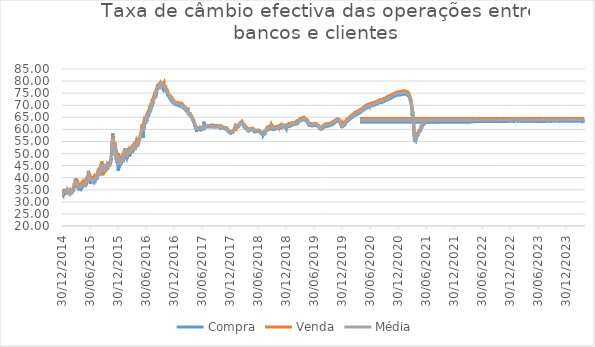
| Category | Compra | Venda | Média |
|---|---|---|---|
| 30/12/2014 | 33.3 | 35.03 | 34.17 |
| 31/12/2014 | 33.58 | 34.35 | 33.97 |
| 05/01/2015 | 32.82 | 34.21 | 33.52 |
| 06/01/2015 | 33.54 | 34.04 | 33.79 |
| 07/01/2015 | 33.3 | 34.14 | 33.72 |
| 08/01/2015 | 33.04 | 34.46 | 33.75 |
| 09/01/2015 | 33.3 | 34.08 | 33.69 |
| 12/01/2015 | 33.65 | 34.8 | 34.23 |
| 13/01/2015 | 32.78 | 35.18 | 33.98 |
| 14/01/2015 | 33.29 | 34.6 | 33.95 |
| 16/01/2015 | 34.04 | 34.74 | 34.39 |
| 19/01/2015 | 34.08 | 34.64 | 34.36 |
| 20/01/2015 | 34.07 | 34.61 | 34.34 |
| 21/01/2015 | 34.06 | 34.84 | 34.45 |
| 22/01/2015 | 34.35 | 34.53 | 34.44 |
| 23/01/2015 | 34.23 | 34.86 | 34.55 |
| 26/01/2015 | 34.39 | 34.87 | 34.63 |
| 27/01/2015 | 34.22 | 35.08 | 34.65 |
| 28/01/2015 | 34.43 | 35.09 | 34.76 |
| 29/01/2015 | 34.36 | 35.43 | 34.9 |
| 30/01/2015 | 33.89 | 33.13 | 33.51 |
| 02/02/2015 | 34.33 | 35.3 | 34.82 |
| 04/02/2015 | 34.2 | 33.6 | 33.9 |
| 05/02/2015 | 34.37 | 35.4 | 34.89 |
| 06/02/2015 | 33.99 | 35.44 | 34.72 |
| 09/02/2015 | 34.26 | 34.74 | 34.5 |
| 10/02/2015 | 33.88 | 34.82 | 34.35 |
| 11/02/2015 | 34.07 | 35.46 | 34.77 |
| 12/02/2015 | 34.16 | 35.29 | 34.73 |
| 13/02/2015 | 34.11 | 34.95 | 34.53 |
| 16/02/2015 | 34.38 | 35.14 | 34.76 |
| 17/02/2015 | 34.41 | 35.14 | 34.78 |
| 18/02/2015 | 34.04 | 34.99 | 34.52 |
| 19/02/2015 | 34.4 | 35.06 | 34.73 |
| 20/02/2015 | 33.67 | 34.35 | 34.01 |
| 23/02/2015 | 34.15 | 34.88 | 34.52 |
| 24/02/2015 | 33.84 | 34.75 | 34.3 |
| 25/02/2015 | 33.94 | 34.78 | 34.36 |
| 26/02/2015 | 34.37 | 34.65 | 34.51 |
| 27/02/2015 | 33.7 | 34.78 | 34.24 |
| 02/03/2015 | 33.42 | 34.19 | 33.81 |
| 03/03/2015 | 33.7 | 33.62 | 33.66 |
| 04/03/2015 | 33.59 | 34.63 | 34.11 |
| 05/03/2015 | 33.92 | 34.58 | 34.25 |
| 06/03/2015 | 33.8 | 34.66 | 34.23 |
| 09/03/2015 | 33.49 | 34.4 | 33.95 |
| 10/03/2015 | 34.04 | 34.76 | 34.4 |
| 11/03/2015 | 34.13 | 34.71 | 34.42 |
| 12/03/2015 | 34.12 | 35.02 | 34.57 |
| 13/03/2015 | 34.54 | 35.8 | 35.17 |
| 16/03/2015 | 34.73 | 36 | 35.37 |
| 17/03/2015 | 35.19 | 36.22 | 35.71 |
| 18/03/2015 | 35.24 | 36.25 | 35.75 |
| 19/03/2015 | 36.42 | 37.78 | 37.1 |
| 20/03/2015 | 36.27 | 37.54 | 36.91 |
| 23/03/2015 | 36.97 | 36.89 | 36.93 |
| 24/03/2015 | 37.26 | 37.73 | 37.5 |
| 25/03/2015 | 37.06 | 38.73 | 37.9 |
| 26/03/2015 | 37.43 | 39.45 | 38.44 |
| 27/03/2015 | 38.55 | 38.84 | 38.7 |
| 30/03/2015 | 38.3 | 39.3 | 38.8 |
| 31/03/2015 | 37.46 | 39.74 | 38.6 |
| 01/04/2015 | 37.33 | 39.43 | 38.38 |
| 02/04/2015 | 36.8 | 39.34 | 38.07 |
| 03/04/2015 | 37.9 | 38.23 | 38.07 |
| 06/04/2015 | 35.96 | 39.09 | 37.53 |
| 08/04/2015 | 36.61 | 36.72 | 36.67 |
| 09/04/2015 | 36.22 | 37.85 | 37.04 |
| 10/04/2015 | 36.3 | 36.45 | 36.38 |
| 13/04/2015 | 35.83 | 37.33 | 36.58 |
| 14/04/2015 | 35.69 | 36.86 | 36.28 |
| 15/04/2015 | 35.51 | 37.01 | 36.26 |
| 16/04/2015 | 35.53 | 36.89 | 36.21 |
| 17/04/2015 | 36.54 | 36.5 | 36.52 |
| 20/04/2015 | 35.65 | 36.7 | 36.18 |
| 21/04/2015 | 35.44 | 36.63 | 36.04 |
| 22/04/2015 | 35.7 | 36.72 | 36.21 |
| 23/04/2015 | 35.34 | 37.46 | 36.4 |
| 24/04/2015 | 35.81 | 36.83 | 36.32 |
| 27/04/2015 | 35.2 | 36.86 | 36.03 |
| 28/04/2015 | 35.41 | 37.01 | 36.21 |
| 29/04/2015 | 35.35 | 36.93 | 36.14 |
| 30/04/2015 | 35.54 | 36.79 | 36.17 |
| 04/05/2015 | 35.52 | 37.62 | 36.57 |
| 05/05/2015 | 35.53 | 37.5 | 36.52 |
| 06/05/2015 | 35.77 | 37.04 | 36.41 |
| 07/05/2015 | 36.22 | 36.87 | 36.55 |
| 08/05/2015 | 35.74 | 36.93 | 36.34 |
| 11/05/2015 | 36.08 | 37.77 | 36.93 |
| 12/05/2015 | 36.17 | 37.32 | 36.75 |
| 13/05/2015 | 36.12 | 37.45 | 36.79 |
| 14/05/2015 | 36.46 | 37.63 | 37.05 |
| 15/05/2015 | 36.73 | 37.22 | 36.98 |
| 18/05/2015 | 36.92 | 37.7 | 37.31 |
| 19/05/2015 | 36.82 | 37.53 | 37.18 |
| 20/05/2015 | 36.88 | 37.89 | 37.39 |
| 21/05/2015 | 36.71 | 38.2 | 37.46 |
| 22/05/2015 | 36.87 | 38.1 | 37.49 |
| 25/05/2015 | 36.82 | 37.81 | 37.32 |
| 26/05/2015 | 36.73 | 38.05 | 37.39 |
| 27/05/2015 | 36.67 | 37.94 | 37.31 |
| 28/05/2015 | 36.9 | 37.56 | 37.23 |
| 29/05/2015 | 36.82 | 38.17 | 37.5 |
| 01/06/2015 | 36.65 | 38.06 | 37.36 |
| 02/06/2015 | 37.05 | 38.23 | 37.64 |
| 03/06/2015 | 37.2 | 38.09 | 37.65 |
| 04/06/2015 | 36.96 | 38.31 | 37.64 |
| 05/06/2015 | 37.31 | 39.33 | 38.32 |
| 08/06/2015 | 37.72 | 38.7 | 38.21 |
| 09/06/2015 | 38.53 | 39 | 38.77 |
| 10/06/2015 | 37.8 | 39.25 | 38.53 |
| 11/06/2015 | 38.03 | 39.46 | 38.75 |
| 12/06/2015 | 37.93 | 38.8 | 38.37 |
| 15/06/2015 | 38 | 38.98 | 38.49 |
| 16/06/2015 | 37.95 | 39.3 | 38.63 |
| 17/06/2015 | 38.69 | 40.02 | 39.36 |
| 18/06/2015 | 39.88 | 41.19 | 40.54 |
| 19/06/2015 | 39.63 | 42.85 | 41.24 |
| 22/06/2015 | 39.38 | 41.44 | 40.41 |
| 23/06/2015 | 39.65 | 42.02 | 40.84 |
| 24/06/2015 | 39.44 | 41.97 | 40.71 |
| 26/06/2015 | 38.99 | 42.25 | 40.62 |
| 29/06/2015 | 38.89 | 41 | 39.95 |
| 30/06/2015 | 38.81 | 40.86 | 39.84 |
| 01/07/2015 | 38.63 | 40.79 | 39.71 |
| 02/07/2015 | 38.45 | 40.5 | 39.48 |
| 03/07/2015 | 38 | 40.61 | 39.31 |
| 06/07/2015 | 38.35 | 39.98 | 39.17 |
| 07/07/2015 | 38.06 | 40.24 | 39.15 |
| 08/07/2015 | 38.34 | 39.81 | 39.08 |
| 09/07/2015 | 38.24 | 39.75 | 39 |
| 10/07/2015 | 38.11 | 39.95 | 39.03 |
| 13/07/2015 | 37.93 | 39.81 | 38.87 |
| 14/07/2015 | 37.7 | 39.37 | 38.54 |
| 15/07/2015 | 38.04 | 39.78 | 38.91 |
| 16/07/2015 | 38.69 | 40.53 | 39.61 |
| 17/07/2015 | 38.2 | 40.38 | 39.29 |
| 20/07/2015 | 38.01 | 39.71 | 38.86 |
| 21/07/2015 | 38 | 40.18 | 39.09 |
| 22/07/2015 | 38.19 | 39.08 | 38.64 |
| 23/07/2015 | 38.25 | 39.78 | 39.02 |
| 24/07/2015 | 38.28 | 39.77 | 39.03 |
| 27/07/2015 | 38.65 | 40.35 | 39.5 |
| 28/07/2015 | 38.21 | 40.45 | 39.33 |
| 29/07/2015 | 39.05 | 40.6 | 39.83 |
| 30/07/2015 | 38.74 | 40.77 | 39.76 |
| 31/07/2015 | 38.48 | 41.08 | 39.78 |
| 03/08/2015 | 38.76 | 40.86 | 39.81 |
| 04/08/2015 | 38.25 | 40.78 | 39.52 |
| 05/08/2015 | 39.04 | 40.5 | 39.77 |
| 06/08/2015 | 39.24 | 39.93 | 39.59 |
| 07/08/2015 | 38.72 | 39.48 | 39.1 |
| 10/08/2015 | 38.7 | 40.88 | 39.79 |
| 11/08/2015 | 39.2 | 41.2 | 40.2 |
| 12/08/2015 | 40.19 | 40.75 | 40.47 |
| 13/08/2015 | 39.1 | 41.3 | 40.2 |
| 14/08/2015 | 39.63 | 41.46 | 40.55 |
| 17/08/2015 | 40.86 | 41.74 | 41.3 |
| 18/08/2015 | 40.36 | 42.09 | 41.23 |
| 19/08/2015 | 40.19 | 41.71 | 40.95 |
| 20/08/2015 | 40.64 | 42.68 | 41.66 |
| 21/08/2015 | 40.65 | 42.64 | 41.65 |
| 24/08/2015 | 41.47 | 42.75 | 42.11 |
| 25/08/2015 | 41.48 | 42.23 | 41.86 |
| 26/08/2015 | 40.88 | 43.22 | 42.05 |
| 27/08/2015 | 41.72 | 42.61 | 42.17 |
| 28/08/2015 | 41.93 | 42.46 | 42.2 |
| 31/08/2015 | 41.44 | 40.99 | 41.22 |
| 01/09/2015 | 41.72 | 43.45 | 42.59 |
| 02/09/2015 | 42.74 | 44.39 | 43.57 |
| 03/09/2015 | 43.26 | 43.49 | 43.38 |
| 04/09/2015 | 43.4 | 43.47 | 43.44 |
| 08/09/2015 | 43.22 | 45.14 | 44.18 |
| 09/09/2015 | 44.42 | 45.18 | 44.8 |
| 10/09/2015 | 43.25 | 45.61 | 44.43 |
| 11/09/2015 | 43.45 | 42.69 | 43.07 |
| 14/09/2015 | 44.71 | 46.11 | 45.41 |
| 15/09/2015 | 43.95 | 45.25 | 44.6 |
| 16/09/2015 | 44.14 | 46.66 | 45.4 |
| 17/09/2015 | 44 | 44.38 | 44.19 |
| 18/09/2015 | 43.06 | 44.51 | 43.79 |
| 21/09/2015 | 43.74 | 45.54 | 44.64 |
| 22/09/2015 | 43.85 | 41.02 | 42.44 |
| 23/09/2015 | 43.73 | 44.76 | 44.25 |
| 24/09/2015 | 43.85 | 44.26 | 44.06 |
| 28/09/2015 | 43.86 | 41.87 | 42.87 |
| 29/09/2015 | 43.9 | 44.76 | 44.33 |
| 30/09/2015 | 44.07 | 44.95 | 44.51 |
| 01/10/2015 | 43.89 | 44.58 | 44.24 |
| 02/10/2015 | 43.74 | 45.23 | 44.49 |
| 06/10/2015 | 44.32 | 45.27 | 44.8 |
| 07/10/2015 | 44.47 | 42.27 | 43.37 |
| 08/10/2015 | 44.22 | 44.51 | 44.37 |
| 09/10/2015 | 44.31 | 45.55 | 44.93 |
| 12/10/2015 | 44.33 | 43.66 | 44 |
| 13/10/2015 | 43.2 | 44.74 | 43.97 |
| 14/10/2015 | 43.98 | 43.11 | 43.55 |
| 15/10/2015 | 44.13 | 45.26 | 44.7 |
| 16/10/2015 | 44.32 | 43.63 | 43.98 |
| 19/10/2015 | 44.25 | 43.16 | 43.71 |
| 20/10/2015 | 44.32 | 45.4 | 44.86 |
| 21/10/2015 | 44.31 | 44.73 | 44.52 |
| 22/10/2015 | 45.04 | 46.14 | 45.59 |
| 23/10/2015 | 44.88 | 45.56 | 45.22 |
| 26/10/2015 | 44.57 | 44.19 | 44.38 |
| 27/10/2015 | 44.34 | 45.78 | 45.06 |
| 28/10/2015 | 44.52 | 45.05 | 44.79 |
| 29/10/2015 | 45.14 | 44.83 | 44.99 |
| 30/10/2015 | 44.86 | 46.31 | 45.59 |
| 02/11/2015 | 44.46 | 44.5 | 44.48 |
| 03/11/2015 | 44.51 | 45.75 | 45.13 |
| 04/11/2015 | 45.43 | 45.83 | 45.63 |
| 05/11/2015 | 45.69 | 45.99 | 45.84 |
| 06/11/2015 | 45.47 | 45.27 | 45.37 |
| 09/11/2015 | 45.82 | 46.8 | 46.31 |
| 11/11/2015 | 45.91 | 45.95 | 45.93 |
| 12/11/2015 | 46.72 | 46.94 | 46.83 |
| 13/11/2015 | 47.09 | 46.86 | 46.98 |
| 16/11/2015 | 47.54 | 47.31 | 47.43 |
| 17/11/2015 | 49.13 | 50.32 | 49.73 |
| 18/11/2015 | 50.29 | 51.49 | 50.89 |
| 19/11/2015 | 52.07 | 52.21 | 52.14 |
| 20/11/2015 | 53.65 | 53.95 | 53.8 |
| 23/11/2015 | 55.36 | 53.74 | 54.55 |
| 24/11/2015 | 55.82 | 57.62 | 56.72 |
| 25/11/2015 | 58.34 | 55.73 | 57.04 |
| 26/11/2015 | 56.42 | 55.4 | 55.91 |
| 27/11/2015 | 55.97 | 56.02 | 56 |
| 30/11/2015 | 55.68 | 57.12 | 56.4 |
| 01/12/2015 | 53.92 | 53.72 | 53.82 |
| 02/12/2015 | 54.07 | 55.15 | 54.61 |
| 03/12/2015 | 53.48 | 54.8 | 54.14 |
| 04/12/2015 | 52.91 | 54.54 | 53.73 |
| 07/12/2015 | 53.23 | 54.92 | 54.08 |
| 08/12/2015 | 51.72 | 53.03 | 52.38 |
| 09/12/2015 | 50.76 | 54.64 | 52.7 |
| 10/12/2015 | 50.76 | 51.49 | 51.13 |
| 11/12/2015 | 50.67 | 49.01 | 49.84 |
| 14/12/2015 | 48.63 | 52.42 | 50.53 |
| 15/12/2015 | 48.53 | 51.27 | 49.9 |
| 16/12/2015 | 47.74 | 49.86 | 48.8 |
| 17/12/2015 | 47.86 | 51.25 | 49.56 |
| 18/12/2015 | 47.48 | 49.32 | 48.4 |
| 21/12/2015 | 47.1 | 49.86 | 48.48 |
| 22/12/2015 | 46.42 | 50.41 | 48.42 |
| 23/12/2015 | 46.11 | 49.33 | 47.72 |
| 24/12/2015 | 46.74 | 48.37 | 47.56 |
| 28/12/2015 | 45.72 | 48.97 | 47.35 |
| 29/12/2015 | 45.89 | 48.02 | 46.96 |
| 30/12/2015 | 45.76 | 48.83 | 47.3 |
| 31/12/2015 | 42.82 | 50.09 | 46.46 |
| 04/01/2016 | 45.22 | 48.03 | 46.63 |
| 05/01/2016 | 45.33 | 45.24 | 45.29 |
| 06/01/2016 | 45.32 | 48.33 | 46.83 |
| 07/01/2016 | 45.46 | 47.5 | 46.48 |
| 08/01/2016 | 46.09 | 48.52 | 47.31 |
| 11/01/2016 | 45.58 | 48.13 | 46.86 |
| 12/01/2016 | 45.61 | 47.7 | 46.66 |
| 13/01/2016 | 46.1 | 49.05 | 47.58 |
| 14/01/2016 | 45.66 | 47.88 | 46.77 |
| 15/01/2016 | 46.45 | 45.41 | 45.93 |
| 18/01/2016 | 45.59 | 48.07 | 46.83 |
| 19/01/2016 | 46.25 | 48.31 | 47.28 |
| 20/01/2016 | 46.96 | 48.3 | 47.63 |
| 21/01/2016 | 46.28 | 48.35 | 47.32 |
| 22/01/2016 | 46.43 | 48.39 | 47.41 |
| 25/01/2016 | 46.21 | 48.61 | 47.41 |
| 26/01/2016 | 46.92 | 49.11 | 48.02 |
| 27/01/2016 | 47 | 46.57 | 46.79 |
| 28/01/2016 | 47.33 | 47.97 | 47.65 |
| 29/01/2016 | 47.4 | 49.99 | 48.7 |
| 01/02/2016 | 46.4 | 49.45 | 47.93 |
| 02/02/2016 | 47.1 | 49.91 | 48.51 |
| 04/02/2016 | 48.09 | 49.41 | 48.75 |
| 05/02/2016 | 48.13 | 50.33 | 49.23 |
| 08/02/2016 | 48.08 | 50.11 | 49.1 |
| 09/02/2016 | 48.52 | 51.34 | 49.93 |
| 10/02/2016 | 48.53 | 49.32 | 48.93 |
| 11/02/2016 | 52.15 | 51.58 | 51.87 |
| 12/02/2016 | 47.9 | 50.11 | 49.01 |
| 15/02/2016 | 49.49 | 50.67 | 50.08 |
| 16/02/2016 | 47.98 | 50.68 | 49.33 |
| 17/02/2016 | 48.92 | 51.26 | 50.09 |
| 18/02/2016 | 48.75 | 50.24 | 49.5 |
| 19/02/2016 | 48.84 | 51.17 | 50.01 |
| 22/02/2016 | 48.28 | 50.81 | 49.55 |
| 23/02/2016 | 49.21 | 49.83 | 49.52 |
| 24/02/2016 | 48.79 | 48.19 | 48.49 |
| 25/02/2016 | 49.08 | 48.33 | 48.71 |
| 26/02/2016 | 47.87 | 49.51 | 48.69 |
| 29/02/2016 | 48.65 | 51.25 | 49.95 |
| 01/03/2016 | 48.85 | 50.93 | 49.89 |
| 02/03/2016 | 49 | 51.59 | 50.3 |
| 03/03/2016 | 48.82 | 51.27 | 50.05 |
| 04/03/2016 | 49.19 | 51.23 | 50.21 |
| 07/03/2016 | 49.22 | 51.87 | 50.55 |
| 08/03/2016 | 49.15 | 52.27 | 50.71 |
| 09/03/2016 | 49.84 | 50.86 | 50.35 |
| 10/03/2016 | 49.61 | 52.32 | 50.97 |
| 11/03/2016 | 50.06 | 52.1 | 51.08 |
| 14/03/2016 | 48.68 | 50.89 | 49.79 |
| 15/03/2016 | 50.57 | 50.58 | 50.58 |
| 16/03/2016 | 50.02 | 52.19 | 51.11 |
| 17/03/2016 | 49.89 | 50.65 | 50.27 |
| 18/03/2016 | 49.36 | 52.43 | 50.9 |
| 21/03/2016 | 50.22 | 50.19 | 50.21 |
| 22/03/2016 | 50.16 | 51.22 | 50.69 |
| 23/03/2016 | 50.61 | 50.71 | 50.66 |
| 24/03/2016 | 50.37 | 52.71 | 51.54 |
| 28/03/2016 | 51.08 | 52.83 | 51.96 |
| 29/03/2016 | 50.28 | 53.04 | 51.66 |
| 30/03/2016 | 50.88 | 51.63 | 51.26 |
| 31/03/2016 | 50.43 | 51.62 | 51.03 |
| 01/04/2016 | 51.32 | 53.62 | 52.47 |
| 04/04/2016 | 50.91 | 54.01 | 52.46 |
| 05/04/2016 | 51.1 | 53.42 | 52.26 |
| 06/04/2016 | 51.63 | 52.97 | 52.3 |
| 08/04/2016 | 51.27 | 53.68 | 52.48 |
| 11/04/2016 | 51.87 | 53.48 | 52.68 |
| 12/04/2016 | 51.84 | 51.57 | 51.71 |
| 13/04/2016 | 52.38 | 53.8 | 53.09 |
| 14/04/2016 | 51.9 | 54.14 | 53.02 |
| 15/04/2016 | 52.44 | 53.99 | 53.22 |
| 18/04/2016 | 52.37 | 54.28 | 53.33 |
| 19/04/2016 | 52.13 | 53.17 | 52.65 |
| 20/04/2016 | 52.55 | 54.82 | 53.69 |
| 21/04/2016 | 53.1 | 53 | 53.05 |
| 22/04/2016 | 52.79 | 53.79 | 53.29 |
| 25/04/2016 | 52.65 | 54.59 | 53.62 |
| 26/04/2016 | 52.95 | 54.45 | 53.7 |
| 27/04/2016 | 52.49 | 53.64 | 53.07 |
| 28/04/2016 | 52.94 | 55 | 53.97 |
| 29/04/2016 | 53.16 | 55.42 | 54.29 |
| 03/05/2016 | 52.86 | 55.12 | 53.99 |
| 04/05/2016 | 53.44 | 54.68 | 54.06 |
| 05/05/2016 | 53.8 | 55.17 | 54.49 |
| 06/05/2016 | 53.12 | 54.53 | 53.83 |
| 09/05/2016 | 52.93 | 54.73 | 53.83 |
| 10/05/2016 | 52.88 | 54.93 | 53.91 |
| 11/05/2016 | 54.64 | 55.43 | 55.04 |
| 12/05/2016 | 54.15 | 55.85 | 55 |
| 13/05/2016 | 54.66 | 56.63 | 55.65 |
| 16/05/2016 | 55.66 | 56.21 | 55.94 |
| 17/05/2016 | 55.37 | 56.29 | 55.83 |
| 18/05/2016 | 55.42 | 55.45 | 55.44 |
| 19/05/2016 | 56.06 | 56.36 | 56.21 |
| 20/05/2016 | 56.31 | 56.97 | 56.64 |
| 23/05/2016 | 56.77 | 57.91 | 57.34 |
| 24/05/2016 | 56.48 | 57.54 | 57.01 |
| 25/05/2016 | 56.8 | 58.24 | 57.52 |
| 26/05/2016 | 57.57 | 58.72 | 58.15 |
| 27/05/2016 | 57.88 | 58.76 | 58.32 |
| 30/05/2016 | 57.32 | 59.11 | 58.22 |
| 31/05/2016 | 58.15 | 59.5 | 58.83 |
| 01/06/2016 | 57.66 | 59.33 | 58.5 |
| 02/06/2016 | 59.16 | 59.69 | 59.43 |
| 03/06/2016 | 60.9 | 62.03 | 61.47 |
| 06/06/2016 | 59.3 | 61.08 | 60.19 |
| 07/06/2016 | 59.48 | 60.47 | 59.98 |
| 08/06/2016 | 60.09 | 60.33 | 60.21 |
| 09/06/2016 | 60.17 | 61.85 | 61.01 |
| 10/06/2016 | 60.65 | 61.61 | 61.13 |
| 13/06/2016 | 56.51 | 62.32 | 59.42 |
| 14/06/2016 | 61.1 | 61.12 | 61.11 |
| 15/06/2016 | 61.58 | 63.07 | 62.33 |
| 16/06/2016 | 61.58 | 62.95 | 62.27 |
| 17/06/2016 | 60.38 | 63.63 | 62.01 |
| 20/06/2016 | 61.92 | 63.05 | 62.49 |
| 21/06/2016 | 62.04 | 63.46 | 62.75 |
| 22/06/2016 | 61.71 | 63.26 | 62.49 |
| 23/06/2016 | 62.37 | 62.96 | 62.67 |
| 24/06/2016 | 62.58 | 63.82 | 63.2 |
| 27/06/2016 | 62.91 | 65.07 | 63.99 |
| 28/06/2016 | 62.48 | 65.08 | 63.78 |
| 29/06/2016 | 63.53 | 64.28 | 63.91 |
| 30/06/2016 | 63.27 | 64.78 | 64.03 |
| 01/07/2016 | 64.2 | 65.75 | 64.98 |
| 04/07/2016 | 64.07 | 64.55 | 64.31 |
| 05/07/2016 | 64.29 | 66.54 | 65.42 |
| 06/07/2016 | 64.82 | 66.64 | 65.73 |
| 07/07/2016 | 63.56 | 64.58 | 64.07 |
| 08/07/2016 | 64.53 | 66.49 | 65.51 |
| 11/07/2016 | 64.31 | 67.03 | 65.67 |
| 12/07/2016 | 65.55 | 66.27 | 65.91 |
| 13/07/2016 | 65.49 | 67.02 | 66.26 |
| 14/07/2016 | 66.63 | 67.93 | 67.28 |
| 15/07/2016 | 65.21 | 67.35 | 66.28 |
| 18/07/2016 | 66.12 | 68 | 67.06 |
| 19/07/2016 | 66.36 | 68.1 | 67.23 |
| 20/07/2016 | 67.62 | 68.44 | 68.03 |
| 21/07/2016 | 66.69 | 68.52 | 67.61 |
| 22/07/2016 | 67.24 | 69.08 | 68.16 |
| 25/07/2016 | 67.73 | 69.33 | 68.53 |
| 26/07/2016 | 67.63 | 69.81 | 68.72 |
| 27/07/2016 | 67.7 | 68.79 | 68.25 |
| 28/07/2016 | 68.62 | 69.77 | 69.2 |
| 29/07/2016 | 68.06 | 69.88 | 68.97 |
| 01/08/2016 | 68.3 | 69.17 | 68.74 |
| 02/08/2016 | 68.09 | 70.01 | 69.05 |
| 03/08/2016 | 69.15 | 70.11 | 69.63 |
| 04/08/2016 | 69.29 | 70.09 | 69.69 |
| 05/08/2016 | 69.27 | 70.69 | 69.98 |
| 08/08/2016 | 69.22 | 71.07 | 70.15 |
| 09/08/2016 | 70.39 | 72.26 | 71.33 |
| 10/08/2016 | 69.49 | 71.3 | 70.4 |
| 11/08/2016 | 70.27 | 72.69 | 71.48 |
| 12/08/2016 | 69.94 | 71.54 | 70.74 |
| 15/08/2016 | 70.48 | 72.56 | 71.52 |
| 16/08/2016 | 71.3 | 72.15 | 71.73 |
| 17/08/2016 | 71.85 | 72.84 | 72.35 |
| 18/08/2016 | 71.79 | 73.67 | 72.73 |
| 19/08/2016 | 72.39 | 73.76 | 73.08 |
| 22/08/2016 | 72.84 | 74.33 | 73.59 |
| 23/08/2016 | 72.92 | 74.17 | 73.55 |
| 24/08/2016 | 73.43 | 75.23 | 74.33 |
| 25/08/2016 | 73.04 | 74.88 | 73.96 |
| 26/08/2016 | 74.1 | 73.13 | 73.62 |
| 29/08/2016 | 72.88 | 75.22 | 74.05 |
| 30/08/2016 | 74.74 | 75.67 | 75.21 |
| 31/08/2016 | 74.01 | 73.24 | 73.63 |
| 01/09/2016 | 73.72 | 75.92 | 74.82 |
| 02/09/2016 | 75.14 | 76.29 | 75.72 |
| 05/09/2016 | 74.4 | 76.5 | 75.45 |
| 06/09/2016 | 75.37 | 76.95 | 76.16 |
| 08/09/2016 | 75.76 | 77.13 | 76.45 |
| 09/09/2016 | 75.57 | 77.33 | 76.45 |
| 12/09/2016 | 77.24 | 78.11 | 77.68 |
| 13/09/2016 | 76.49 | 78.65 | 77.57 |
| 14/09/2016 | 76.08 | 77.83 | 76.96 |
| 15/09/2016 | 76.91 | 76.77 | 76.84 |
| 16/09/2016 | 77.27 | 77.88 | 77.58 |
| 19/09/2016 | 76.97 | 76.85 | 76.91 |
| 20/09/2016 | 77.14 | 78.96 | 78.05 |
| 21/09/2016 | 77.35 | 78.66 | 78.01 |
| 22/09/2016 | 77.12 | 77.67 | 77.4 |
| 23/09/2016 | 77.72 | 78.73 | 78.23 |
| 27/09/2016 | 77.9 | 77.92 | 77.91 |
| 28/09/2016 | 77.51 | 79.44 | 78.48 |
| 29/09/2016 | 77.61 | 79.34 | 78.48 |
| 30/09/2016 | 77.42 | 78.25 | 77.84 |
| 03/10/2016 | 77.66 | 79.19 | 78.43 |
| 05/10/2016 | 77.58 | 79.47 | 78.53 |
| 06/10/2016 | 77.62 | 78.88 | 78.25 |
| 07/10/2016 | 77.2 | 78.75 | 77.98 |
| 10/10/2016 | 77.3 | 78.97 | 78.14 |
| 11/10/2016 | 77.07 | 78.88 | 77.98 |
| 12/10/2016 | 77.74 | 79.16 | 78.45 |
| 13/10/2016 | 77.56 | 78.49 | 78.03 |
| 14/10/2016 | 77.59 | 78.78 | 78.19 |
| 17/10/2016 | 77.01 | 79.6 | 78.31 |
| 18/10/2016 | 77.53 | 78.11 | 77.82 |
| 19/10/2016 | 77.52 | 79.14 | 78.33 |
| 20/10/2016 | 77.18 | 78.61 | 77.9 |
| 21/10/2016 | 77.77 | 78.84 | 78.31 |
| 24/10/2016 | 77.1 | 79.16 | 78.13 |
| 25/10/2016 | 77.19 | 78.61 | 77.9 |
| 26/10/2016 | 77.22 | 78.36 | 77.79 |
| 27/10/2016 | 76.93 | 78.39 | 77.66 |
| 28/10/2016 | 77.11 | 77.23 | 77.17 |
| 31/10/2016 | 76.75 | 78.33 | 77.54 |
| 01/11/2016 | 76.86 | 77.95 | 77.41 |
| 02/11/2016 | 76.21 | 77.5 | 76.86 |
| 03/11/2016 | 76.12 | 77.68 | 76.9 |
| 04/11/2016 | 76.37 | 77.36 | 76.87 |
| 07/11/2016 | 76.11 | 77.2 | 76.66 |
| 08/11/2016 | 75.92 | 77.02 | 76.47 |
| 09/11/2016 | 75.59 | 76.93 | 76.26 |
| 11/11/2016 | 75.62 | 77.08 | 76.35 |
| 14/11/2016 | 75.18 | 76.97 | 76.08 |
| 15/11/2016 | 75.11 | 76.43 | 75.77 |
| 16/11/2016 | 74.87 | 75.83 | 75.35 |
| 17/11/2016 | 74.16 | 75.9 | 75.03 |
| 18/11/2016 | 74.45 | 75.58 | 75.02 |
| 21/11/2016 | 74.56 | 75.58 | 75.07 |
| 22/11/2016 | 74.23 | 75.49 | 74.86 |
| 23/11/2016 | 73.8 | 74.87 | 74.34 |
| 24/11/2016 | 74.02 | 75 | 74.51 |
| 25/11/2016 | 73.47 | 75.08 | 74.28 |
| 28/11/2016 | 73.36 | 74.79 | 74.08 |
| 29/11/2016 | 73.24 | 74.24 | 73.74 |
| 30/11/2016 | 73.43 | 74.29 | 73.86 |
| 01/12/2016 | 72.84 | 74.14 | 73.49 |
| 02/12/2016 | 73.39 | 74.1 | 73.75 |
| 05/12/2016 | 72.65 | 74.11 | 73.38 |
| 06/12/2016 | 72.95 | 73.87 | 73.41 |
| 07/12/2016 | 72.69 | 73.84 | 73.27 |
| 08/12/2016 | 72.3 | 73.47 | 72.89 |
| 09/12/2016 | 72.32 | 73.56 | 72.94 |
| 12/12/2016 | 72.32 | 73.46 | 72.89 |
| 13/12/2016 | 72.05 | 73.36 | 72.71 |
| 14/12/2016 | 71.88 | 73 | 72.44 |
| 15/12/2016 | 71.69 | 72.78 | 72.24 |
| 16/12/2016 | 71.55 | 72.81 | 72.18 |
| 19/12/2016 | 71.46 | 72.98 | 72.22 |
| 20/12/2016 | 71.56 | 72.7 | 72.13 |
| 21/12/2016 | 71.4 | 72.34 | 71.87 |
| 22/12/2016 | 71.01 | 71.54 | 71.28 |
| 23/12/2016 | 71.05 | 72.28 | 71.67 |
| 27/12/2016 | 71.14 | 72.1 | 71.62 |
| 28/12/2016 | 71.09 | 72.04 | 71.57 |
| 29/12/2016 | 70.75 | 71.85 | 71.3 |
| 30/12/2016 | 70.48 | 71.86 | 71.17 |
| 03/01/2017 | 70.68 | 71.43 | 71.06 |
| 04/01/2017 | 70.6 | 71.43 | 71.02 |
| 05/01/2017 | 70.46 | 71.13 | 70.8 |
| 06/01/2017 | 70.23 | 71.46 | 70.85 |
| 09/01/2017 | 70.51 | 71.73 | 71.12 |
| 10/01/2017 | 70.22 | 71.22 | 70.72 |
| 11/01/2017 | 70.05 | 70.9 | 70.48 |
| 12/01/2017 | 70.06 | 71.25 | 70.66 |
| 13/01/2017 | 70.07 | 71.1 | 70.59 |
| 16/01/2017 | 69.92 | 71.6 | 70.76 |
| 17/01/2017 | 69.94 | 71.01 | 70.48 |
| 18/01/2017 | 70.28 | 71.38 | 70.83 |
| 19/01/2017 | 70.08 | 71.19 | 70.64 |
| 20/01/2017 | 70.12 | 70.69 | 70.41 |
| 23/01/2017 | 70.01 | 71.16 | 70.59 |
| 24/01/2017 | 69.85 | 71.13 | 70.49 |
| 25/01/2017 | 69.87 | 71.18 | 70.53 |
| 26/01/2017 | 69.98 | 71.25 | 70.62 |
| 27/01/2017 | 69.92 | 71.33 | 70.63 |
| 30/01/2017 | 69.92 | 71.35 | 70.64 |
| 31/01/2017 | 69.96 | 70.89 | 70.43 |
| 01/02/2017 | 69.75 | 71.08 | 70.42 |
| 02/02/2017 | 70 | 71.1 | 70.55 |
| 06/02/2017 | 69.58 | 71.29 | 70.44 |
| 07/02/2017 | 69.89 | 70.85 | 70.37 |
| 08/02/2017 | 69.77 | 70.87 | 70.32 |
| 09/02/2017 | 69.91 | 70.73 | 70.32 |
| 10/02/2017 | 69.74 | 70.25 | 70 |
| 13/02/2017 | 69.83 | 70.64 | 70.24 |
| 14/02/2017 | 69.31 | 70.18 | 69.75 |
| 15/02/2017 | 69.4 | 70.49 | 69.95 |
| 16/02/2017 | 69.8 | 70.48 | 70.14 |
| 17/02/2017 | 69.62 | 70.17 | 69.9 |
| 20/02/2017 | 69.57 | 70.36 | 69.97 |
| 21/02/2017 | 69.56 | 70.31 | 69.94 |
| 22/02/2017 | 69.06 | 69.72 | 69.39 |
| 23/02/2017 | 69.11 | 70.31 | 69.71 |
| 24/02/2017 | 69.09 | 70.02 | 69.56 |
| 27/02/2017 | 68.98 | 70 | 69.49 |
| 28/02/2017 | 69 | 69.92 | 69.46 |
| 01/03/2017 | 69.01 | 69.94 | 69.48 |
| 02/03/2017 | 68.67 | 69.76 | 69.22 |
| 03/03/2017 | 68.65 | 69.69 | 69.17 |
| 06/03/2017 | 68.6 | 69.43 | 69.02 |
| 07/03/2017 | 68.42 | 69.42 | 68.92 |
| 08/03/2017 | 68.31 | 69.14 | 68.73 |
| 09/03/2017 | 68.26 | 69.17 | 68.72 |
| 10/03/2017 | 68.27 | 69.13 | 68.7 |
| 13/03/2017 | 68.15 | 69.03 | 68.59 |
| 14/03/2017 | 68.22 | 69.03 | 68.63 |
| 15/03/2017 | 68.22 | 69.01 | 68.62 |
| 16/03/2017 | 68.11 | 68.88 | 68.5 |
| 17/03/2017 | 67.66 | 68.57 | 68.12 |
| 20/03/2017 | 67.78 | 68.66 | 68.22 |
| 21/03/2017 | 67.9 | 68.68 | 68.29 |
| 22/03/2017 | 67.7 | 68.9 | 68.3 |
| 23/03/2017 | 67.5 | 68.36 | 67.93 |
| 24/03/2017 | 67.45 | 68.42 | 67.94 |
| 27/03/2017 | 67.17 | 68.17 | 67.67 |
| 28/03/2017 | 67.59 | 68.08 | 67.84 |
| 29/03/2017 | 67.12 | 67.71 | 67.42 |
| 30/03/2017 | 67.94 | 67.77 | 67.86 |
| 31/03/2017 | 66.44 | 67.89 | 67.17 |
| 03/04/2017 | 66.34 | 67.42 | 66.88 |
| 04/04/2017 | 66.53 | 66.43 | 66.48 |
| 05/04/2017 | 66.14 | 67 | 66.57 |
| 06/04/2017 | 66.47 | 67.02 | 66.75 |
| 10/04/2017 | 65.83 | 66.15 | 65.99 |
| 11/04/2017 | 65.95 | 66.94 | 66.45 |
| 12/04/2017 | 65.76 | 66.59 | 66.18 |
| 13/04/2017 | 65.75 | 66.27 | 66.01 |
| 17/04/2017 | 65.62 | 66.45 | 66.04 |
| 18/04/2017 | 65.56 | 66.24 | 65.9 |
| 19/04/2017 | 65.35 | 66.11 | 65.73 |
| 20/04/2017 | 65.27 | 65.23 | 65.25 |
| 21/04/2017 | 65.12 | 65.91 | 65.52 |
| 24/04/2017 | 64.84 | 65.63 | 65.24 |
| 25/04/2017 | 64.55 | 65.66 | 65.11 |
| 26/04/2017 | 64.34 | 65.62 | 64.98 |
| 27/04/2017 | 64.27 | 64.7 | 64.49 |
| 28/04/2017 | 64.02 | 65 | 64.51 |
| 02/05/2017 | 64.19 | 64.53 | 64.36 |
| 03/05/2017 | 63.67 | 64.38 | 64.03 |
| 04/05/2017 | 63.34 | 64.15 | 63.75 |
| 05/05/2017 | 63.15 | 64.18 | 63.67 |
| 08/05/2017 | 62.73 | 63.53 | 63.13 |
| 09/05/2017 | 62.96 | 63.24 | 63.1 |
| 10/05/2017 | 62.57 | 63.01 | 62.79 |
| 11/05/2017 | 62.1 | 62.79 | 62.45 |
| 12/05/2017 | 61.57 | 62.76 | 62.17 |
| 15/05/2017 | 61.68 | 62.37 | 62.03 |
| 16/05/2017 | 61.24 | 62.09 | 61.67 |
| 17/05/2017 | 60.79 | 61.28 | 61.04 |
| 18/05/2017 | 60.8 | 61.69 | 61.25 |
| 19/05/2017 | 60.54 | 61.32 | 60.93 |
| 22/05/2017 | 60.5 | 60.95 | 60.73 |
| 23/05/2017 | 59.8 | 60.62 | 60.21 |
| 24/05/2017 | 59.41 | 60.08 | 59.75 |
| 25/05/2017 | 59.05 | 60.85 | 59.95 |
| 26/05/2017 | 59.27 | 60 | 59.64 |
| 29/05/2017 | 59.12 | 60.15 | 59.64 |
| 30/05/2017 | 60.92 | 60.69 | 60.81 |
| 31/05/2017 | 60.27 | 60.74 | 60.51 |
| 01/06/2017 | 60.06 | 60.99 | 60.53 |
| 02/06/2017 | 60.16 | 60.7 | 60.43 |
| 05/06/2017 | 60.01 | 60.87 | 60.44 |
| 06/06/2017 | 60.18 | 60.78 | 60.48 |
| 07/06/2017 | 60.06 | 60.77 | 60.42 |
| 08/06/2017 | 59.97 | 60.76 | 60.37 |
| 09/06/2017 | 60.23 | 60.97 | 60.6 |
| 12/06/2017 | 60.39 | 60.61 | 60.5 |
| 13/06/2017 | 60.92 | 60.78 | 60.85 |
| 14/06/2017 | 60.05 | 60.89 | 60.47 |
| 15/06/2017 | 60.07 | 60.77 | 60.42 |
| 16/06/2017 | 60.06 | 60.64 | 60.35 |
| 19/06/2017 | 59.85 | 60.66 | 60.26 |
| 20/06/2017 | 59.92 | 60.68 | 60.3 |
| 21/06/2017 | 59.71 | 60.69 | 60.2 |
| 22/06/2017 | 59.81 | 60.77 | 60.29 |
| 23/06/2017 | 60.12 | 60.96 | 60.54 |
| 27/06/2017 | 59.93 | 60.75 | 60.34 |
| 28/06/2017 | 60.11 | 60.7 | 60.41 |
| 29/06/2017 | 59.88 | 60.95 | 60.42 |
| 30/06/2017 | 59.94 | 60.78 | 60.36 |
| 03/07/2017 | 59.99 | 60.67 | 60.33 |
| 04/07/2017 | 60.23 | 60.93 | 60.58 |
| 05/07/2017 | 60.21 | 61.25 | 60.73 |
| 06/07/2017 | 60.05 | 60.96 | 60.51 |
| 07/07/2017 | 60.25 | 60.93 | 60.59 |
| 10/07/2017 | 60.73 | 60.98 | 60.86 |
| 11/07/2017 | 60.08 | 61.01 | 60.55 |
| 12/07/2017 | 63.12 | 61.18 | 62.15 |
| 13/07/2017 | 60.32 | 60.99 | 60.66 |
| 14/07/2017 | 60.38 | 61 | 60.69 |
| 17/07/2017 | 60.42 | 61.01 | 60.72 |
| 18/07/2017 | 60.49 | 61.2 | 60.85 |
| 19/07/2017 | 60.63 | 61.37 | 61 |
| 20/07/2017 | 60.65 | 61.45 | 61.05 |
| 21/07/2017 | 60.9 | 61.49 | 61.2 |
| 24/07/2017 | 60.94 | 61.62 | 61.28 |
| 25/07/2017 | 60.93 | 61.62 | 61.28 |
| 26/07/2017 | 60.94 | 61.83 | 61.39 |
| 27/07/2017 | 60.98 | 61.49 | 61.24 |
| 28/07/2017 | 60.88 | 61.66 | 61.27 |
| 31/07/2017 | 60.8 | 61.58 | 61.19 |
| 01/08/2017 | 60.98 | 61.82 | 61.4 |
| 02/08/2017 | 61.04 | 61.73 | 61.39 |
| 03/08/2017 | 61.05 | 61.94 | 61.5 |
| 04/08/2017 | 61.16 | 61.67 | 61.42 |
| 07/08/2017 | 60.99 | 61.53 | 61.26 |
| 08/08/2017 | 60.97 | 61.84 | 61.41 |
| 09/08/2017 | 60.96 | 61.55 | 61.26 |
| 10/08/2017 | 61.1 | 61.57 | 61.34 |
| 11/08/2017 | 61.15 | 61.66 | 61.41 |
| 14/08/2017 | 60.88 | 61.6 | 61.24 |
| 15/08/2017 | 60.85 | 61.58 | 61.22 |
| 16/08/2017 | 60.92 | 61.55 | 61.24 |
| 17/08/2017 | 60.96 | 61.54 | 61.25 |
| 18/08/2017 | 61 | 61.62 | 61.31 |
| 21/08/2017 | 60.93 | 61.61 | 61.27 |
| 22/08/2017 | 61.11 | 61.72 | 61.42 |
| 23/08/2017 | 61.24 | 61.68 | 61.46 |
| 24/08/2017 | 61.15 | 61.75 | 61.45 |
| 25/08/2017 | 61 | 61.73 | 61.37 |
| 28/08/2017 | 61.02 | 61.8 | 61.41 |
| 29/08/2017 | 61.01 | 61.59 | 61.3 |
| 30/08/2017 | 61.07 | 61.79 | 61.43 |
| 31/08/2017 | 60.98 | 61.58 | 61.28 |
| 01/09/2017 | 61.17 | 61.74 | 61.46 |
| 04/09/2017 | 61.15 | 61.9 | 61.53 |
| 05/09/2017 | 61.36 | 61.82 | 61.59 |
| 06/09/2017 | 61.05 | 61.78 | 61.42 |
| 08/09/2017 | 61.03 | 61.59 | 61.31 |
| 11/09/2017 | 61.23 | 61.61 | 61.42 |
| 12/09/2017 | 61.1 | 61.54 | 61.32 |
| 13/09/2017 | 61.05 | 61.65 | 61.35 |
| 14/09/2017 | 60.96 | 61.72 | 61.34 |
| 15/09/2017 | 61.09 | 61.62 | 61.36 |
| 18/09/2017 | 61.02 | 61.73 | 61.38 |
| 19/09/2017 | 61.13 | 61.68 | 61.41 |
| 20/09/2017 | 61.04 | 61.47 | 61.26 |
| 21/09/2017 | 61.12 | 61.52 | 61.32 |
| 22/09/2017 | 60.88 | 61.56 | 61.22 |
| 26/09/2017 | 60.94 | 61.6 | 61.27 |
| 27/09/2017 | 60.9 | 61.83 | 61.37 |
| 28/09/2017 | 61.1 | 61.54 | 61.32 |
| 29/09/2017 | 61.02 | 61.55 | 61.29 |
| 02/10/2017 | 60.99 | 61.86 | 61.43 |
| 03/10/2017 | 60.94 | 61.6 | 61.27 |
| 05/10/2017 | 61.06 | 61.53 | 61.3 |
| 06/10/2017 | 60.97 | 61.47 | 61.22 |
| 09/10/2017 | 61.01 | 61.5 | 61.26 |
| 10/10/2017 | 61.13 | 61.66 | 61.4 |
| 11/10/2017 | 61.03 | 61.57 | 61.3 |
| 12/10/2017 | 61.01 | 61.51 | 61.26 |
| 13/10/2017 | 61.03 | 61.5 | 61.27 |
| 16/10/2017 | 60.91 | 61.49 | 61.2 |
| 17/10/2017 | 60.81 | 61.47 | 61.14 |
| 18/10/2017 | 60.88 | 61.35 | 61.12 |
| 19/10/2017 | 60.84 | 60.95 | 60.9 |
| 20/10/2017 | 60.72 | 61.27 | 61 |
| 23/10/2017 | 60.47 | 61.3 | 60.89 |
| 24/10/2017 | 60.61 | 61.22 | 60.92 |
| 25/10/2017 | 60.41 | 61.14 | 60.78 |
| 26/10/2017 | 60.64 | 60.83 | 60.74 |
| 27/10/2017 | 60.35 | 61.06 | 60.71 |
| 30/10/2017 | 60.34 | 61.23 | 60.79 |
| 31/10/2017 | 60.51 | 61.04 | 60.78 |
| 01/11/2017 | 60.45 | 61 | 60.73 |
| 02/11/2017 | 60.52 | 60.95 | 60.74 |
| 03/11/2017 | 60.54 | 61.4 | 60.97 |
| 06/11/2017 | 60.81 | 61.12 | 60.97 |
| 07/11/2017 | 60.63 | 61.51 | 61.07 |
| 08/11/2017 | 60.68 | 61.14 | 60.91 |
| 09/11/2017 | 60.62 | 61.13 | 60.88 |
| 13/11/2017 | 60.6 | 60.99 | 60.8 |
| 14/11/2017 | 60.4 | 61.19 | 60.8 |
| 15/11/2017 | 60.49 | 60.97 | 60.73 |
| 16/11/2017 | 60.51 | 61.08 | 60.8 |
| 17/11/2017 | 60.37 | 60.99 | 60.68 |
| 20/11/2017 | 60.37 | 60.92 | 60.65 |
| 21/11/2017 | 60.67 | 61 | 60.84 |
| 22/11/2017 | 60.29 | 60.93 | 60.61 |
| 23/11/2017 | 60.33 | 61.15 | 60.74 |
| 24/11/2017 | 60.14 | 60.95 | 60.55 |
| 27/11/2017 | 60.14 | 60.7 | 60.42 |
| 28/11/2017 | 60.2 | 61.01 | 60.61 |
| 29/11/2017 | 60.51 | 60.82 | 60.67 |
| 30/11/2017 | 60.16 | 60.99 | 60.58 |
| 01/12/2017 | 60.08 | 60.88 | 60.48 |
| 04/12/2017 | 60.02 | 60.76 | 60.39 |
| 05/12/2017 | 59.97 | 60.55 | 60.26 |
| 06/12/2017 | 60.04 | 60.5 | 60.27 |
| 07/12/2017 | 59.75 | 60.34 | 60.05 |
| 08/12/2017 | 59.72 | 60.51 | 60.12 |
| 11/12/2017 | 59.68 | 60.14 | 59.91 |
| 12/12/2017 | 59.63 | 60.16 | 59.9 |
| 13/12/2017 | 59.35 | 60.31 | 59.83 |
| 14/12/2017 | 59.25 | 60.14 | 59.7 |
| 15/12/2017 | 58.98 | 59.91 | 59.45 |
| 18/12/2017 | 59.11 | 59.7 | 59.41 |
| 19/12/2017 | 59.02 | 59.69 | 59.36 |
| 20/12/2017 | 58.82 | 59.55 | 59.19 |
| 21/12/2017 | 58.66 | 59.42 | 59.04 |
| 22/12/2017 | 58.41 | 59.39 | 58.9 |
| 26/12/2017 | 58.6 | 59.17 | 58.89 |
| 27/12/2017 | 58.61 | 59.26 | 58.94 |
| 28/12/2017 | 58.48 | 59.27 | 58.88 |
| 29/12/2017 | 58.53 | 59.3 | 58.92 |
| 02/01/2018 | 58.38 | 59.16 | 58.77 |
| 03/01/2018 | 58.29 | 59.25 | 58.77 |
| 04/01/2018 | 58.49 | 59.13 | 58.81 |
| 05/01/2018 | 58.32 | 59.22 | 58.77 |
| 08/01/2018 | 58.36 | 59.14 | 58.75 |
| 09/01/2018 | 58.56 | 59.15 | 58.86 |
| 10/01/2018 | 58.71 | 59.32 | 59.02 |
| 11/01/2018 | 58.62 | 59.12 | 58.87 |
| 12/01/2018 | 58.53 | 59.26 | 58.9 |
| 15/01/2018 | 58.53 | 59.31 | 58.92 |
| 16/01/2018 | 58.72 | 59.36 | 59.04 |
| 17/01/2018 | 58.8 | 59.47 | 59.14 |
| 18/01/2018 | 58.92 | 59.55 | 59.24 |
| 19/01/2018 | 58.8 | 59.3 | 59.05 |
| 22/01/2018 | 59.14 | 59.81 | 59.48 |
| 23/01/2018 | 59.51 | 60.14 | 59.83 |
| 24/01/2018 | 59.32 | 60.15 | 59.74 |
| 25/01/2018 | 59.56 | 60.19 | 59.88 |
| 26/01/2018 | 59.68 | 60.43 | 60.06 |
| 29/01/2018 | 59.92 | 60.89 | 60.41 |
| 30/01/2018 | 60.14 | 61.29 | 60.72 |
| 31/01/2018 | 60.29 | 61.1 | 60.7 |
| 01/02/2018 | 60.91 | 61.45 | 61.18 |
| 02/02/2018 | 60.68 | 61.48 | 61.08 |
| 05/02/2018 | 61.16 | 61.69 | 61.43 |
| 06/02/2018 | 60.86 | 60.84 | 60.85 |
| 07/02/2018 | 60.72 | 61.6 | 61.16 |
| 08/02/2018 | 60.86 | 61.41 | 61.14 |
| 09/02/2018 | 60.94 | 61.33 | 61.14 |
| 12/02/2018 | 60.71 | 61.34 | 61.03 |
| 13/02/2018 | 60.86 | 61.57 | 61.22 |
| 14/02/2018 | 60.8 | 61.64 | 61.22 |
| 15/02/2018 | 60.85 | 61.11 | 60.98 |
| 16/02/2018 | 61.12 | 61.38 | 61.25 |
| 19/02/2018 | 61.04 | 61.74 | 61.39 |
| 20/02/2018 | 60.97 | 61.85 | 61.41 |
| 21/02/2018 | 61.1 | 61.6 | 61.35 |
| 22/02/2018 | 61.07 | 61.7 | 61.39 |
| 23/02/2018 | 61.11 | 61.88 | 61.5 |
| 26/02/2018 | 61.46 | 62.26 | 61.86 |
| 27/02/2018 | 61.35 | 61.98 | 61.67 |
| 28/02/2018 | 61.47 | 62.21 | 61.84 |
| 01/03/2018 | 61.86 | 62.3 | 62.08 |
| 02/03/2018 | 62.07 | 62.71 | 62.39 |
| 05/03/2018 | 61.99 | 62.62 | 62.31 |
| 06/03/2018 | 62.05 | 62.42 | 62.24 |
| 07/03/2018 | 62.11 | 62.76 | 62.44 |
| 08/03/2018 | 62.2 | 62.96 | 62.58 |
| 09/03/2018 | 62.19 | 62.86 | 62.53 |
| 12/03/2018 | 62.16 | 62.99 | 62.58 |
| 13/03/2018 | 62.1 | 62.73 | 62.42 |
| 14/03/2018 | 62.73 | 63.11 | 62.92 |
| 15/03/2018 | 62.37 | 63.11 | 62.74 |
| 16/03/2018 | 62.3 | 63.34 | 62.82 |
| 19/03/2018 | 62.25 | 63.01 | 62.63 |
| 20/03/2018 | 62.17 | 62.88 | 62.53 |
| 21/03/2018 | 61.99 | 62.87 | 62.43 |
| 22/03/2018 | 62.02 | 62.98 | 62.5 |
| 23/03/2018 | 62.13 | 62.42 | 62.28 |
| 26/03/2018 | 61.74 | 62.53 | 62.14 |
| 27/03/2018 | 61.66 | 62.41 | 62.04 |
| 28/03/2018 | 61.46 | 62.25 | 61.86 |
| 29/03/2018 | 61.12 | 62.13 | 61.63 |
| 02/04/2018 | 61.05 | 62.09 | 61.57 |
| 03/04/2018 | 60.98 | 61.83 | 61.41 |
| 04/04/2018 | 60.99 | 61.64 | 61.32 |
| 05/04/2018 | 60.58 | 61.76 | 61.17 |
| 06/04/2018 | 60.48 | 61.48 | 60.98 |
| 09/04/2018 | 60.55 | 61.41 | 60.98 |
| 10/04/2018 | 60.7 | 61.37 | 61.04 |
| 11/04/2018 | 60.32 | 61.09 | 60.71 |
| 12/04/2018 | 60.35 | 61 | 60.68 |
| 13/04/2018 | 60.41 | 60.99 | 60.7 |
| 16/04/2018 | 60.24 | 60.87 | 60.56 |
| 17/04/2018 | 59.93 | 60.75 | 60.34 |
| 18/04/2018 | 60.05 | 60.79 | 60.42 |
| 19/04/2018 | 59.6 | 60.48 | 60.04 |
| 20/04/2018 | 59.69 | 60.38 | 60.04 |
| 23/04/2018 | 59.65 | 60.24 | 59.95 |
| 24/04/2018 | 59.41 | 60.18 | 59.8 |
| 25/04/2018 | 59.45 | 60.13 | 59.79 |
| 26/04/2018 | 59.2 | 59.71 | 59.46 |
| 27/04/2018 | 59.23 | 60.14 | 59.69 |
| 30/04/2018 | 59.4 | 60.08 | 59.74 |
| 02/05/2018 | 59.37 | 60.53 | 59.95 |
| 03/05/2018 | 59.48 | 60.15 | 59.82 |
| 04/05/2018 | 59.4 | 60.18 | 59.79 |
| 07/05/2018 | 59.25 | 60.24 | 59.75 |
| 08/05/2018 | 59.4 | 60.24 | 59.82 |
| 09/05/2018 | 59.68 | 60.16 | 59.92 |
| 10/05/2018 | 59.78 | 60.58 | 60.18 |
| 11/05/2018 | 59.78 | 60.41 | 60.1 |
| 14/05/2018 | 59.72 | 60.46 | 60.09 |
| 15/05/2018 | 59.94 | 60.64 | 60.29 |
| 16/05/2018 | 59.87 | 60.56 | 60.22 |
| 17/05/2018 | 59.84 | 60.69 | 60.27 |
| 18/05/2018 | 59.83 | 60.5 | 60.17 |
| 21/05/2018 | 59.87 | 60.54 | 60.21 |
| 22/05/2018 | 59.94 | 60.59 | 60.27 |
| 23/05/2018 | 59.86 | 60.66 | 60.26 |
| 24/05/2018 | 59.86 | 60.59 | 60.23 |
| 25/05/2018 | 59.93 | 60.47 | 60.2 |
| 28/05/2018 | 59.92 | 60.46 | 60.19 |
| 29/05/2018 | 59.8 | 60.48 | 60.14 |
| 30/05/2018 | 59.76 | 60.45 | 60.11 |
| 31/05/2018 | 59.72 | 60.21 | 59.97 |
| 01/06/2018 | 59.28 | 60.2 | 59.74 |
| 04/06/2018 | 59.41 | 60 | 59.71 |
| 05/06/2018 | 59.37 | 60.07 | 59.72 |
| 06/06/2018 | 59.05 | 59.96 | 59.51 |
| 07/06/2018 | 59.23 | 59.75 | 59.49 |
| 08/06/2018 | 58.91 | 59.66 | 59.29 |
| 11/06/2018 | 58.97 | 59.48 | 59.23 |
| 12/06/2018 | 59.18 | 59.56 | 59.37 |
| 13/06/2018 | 59.13 | 59.66 | 59.4 |
| 14/06/2018 | 59.08 | 59.67 | 59.38 |
| 15/06/2018 | 59.2 | 59.77 | 59.49 |
| 18/06/2018 | 59 | 59.68 | 59.34 |
| 19/06/2018 | 59.1 | 59.64 | 59.37 |
| 20/06/2018 | 59.05 | 59.77 | 59.41 |
| 21/06/2018 | 58.82 | 59.6 | 59.21 |
| 22/06/2018 | 59.1 | 59.61 | 59.36 |
| 26/06/2018 | 59.04 | 59.65 | 59.35 |
| 27/06/2018 | 59.31 | 59.65 | 59.48 |
| 28/06/2018 | 59.11 | 59.75 | 59.43 |
| 29/06/2018 | 59.11 | 59.82 | 59.47 |
| 02/07/2018 | 59.19 | 59.63 | 59.41 |
| 03/07/2018 | 59.27 | 59.68 | 59.48 |
| 04/07/2018 | 59.08 | 59.73 | 59.41 |
| 05/07/2018 | 59.19 | 59.67 | 59.43 |
| 06/07/2018 | 59.07 | 59.76 | 59.42 |
| 09/07/2018 | 59.09 | 59.68 | 59.39 |
| 10/07/2018 | 58.93 | 59.52 | 59.23 |
| 11/07/2018 | 58.9 | 59.64 | 59.27 |
| 12/07/2018 | 58.68 | 59.46 | 59.07 |
| 13/07/2018 | 58.69 | 59.37 | 59.03 |
| 16/07/2018 | 58.52 | 59.16 | 58.84 |
| 17/07/2018 | 58.82 | 59.09 | 58.96 |
| 18/07/2018 | 58.51 | 59.05 | 58.78 |
| 19/07/2018 | 58.27 | 58.98 | 58.63 |
| 20/07/2018 | 58.18 | 58.76 | 58.47 |
| 23/07/2018 | 58.33 | 58.75 | 58.54 |
| 24/07/2018 | 58.17 | 58.72 | 58.45 |
| 25/07/2018 | 57.89 | 58.59 | 58.24 |
| 26/07/2018 | 57.97 | 58.63 | 58.3 |
| 27/07/2018 | 58.12 | 58.74 | 58.43 |
| 30/07/2018 | 57.98 | 58.57 | 58.28 |
| 31/07/2018 | 57.87 | 58.49 | 58.18 |
| 01/08/2018 | 58.04 | 58.41 | 58.23 |
| 02/08/2018 | 58.52 | 58.41 | 58.47 |
| 03/08/2018 | 57.63 | 58.47 | 58.05 |
| 06/08/2018 | 57.69 | 58.34 | 58.02 |
| 07/08/2018 | 58.05 | 58.43 | 58.24 |
| 08/08/2018 | 58.03 | 58.39 | 58.21 |
| 09/08/2018 | 57.72 | 58.39 | 58.06 |
| 10/08/2018 | 57.85 | 58.5 | 58.18 |
| 13/08/2018 | 57.82 | 58.44 | 58.13 |
| 14/08/2018 | 58.05 | 58.94 | 58.5 |
| 15/08/2018 | 58.49 | 59.16 | 58.83 |
| 16/08/2018 | 58.98 | 59.55 | 59.27 |
| 17/08/2018 | 58.78 | 59.49 | 59.14 |
| 20/08/2018 | 59.55 | 59.93 | 59.74 |
| 21/08/2018 | 59.49 | 60.03 | 59.76 |
| 22/08/2018 | 59.07 | 59.4 | 59.24 |
| 23/08/2018 | 59.12 | 60.11 | 59.62 |
| 24/08/2018 | 59.55 | 60.3 | 59.93 |
| 27/08/2018 | 59.33 | 60.19 | 59.76 |
| 28/08/2018 | 59.67 | 60.43 | 60.05 |
| 29/08/2018 | 59.73 | 60.54 | 60.14 |
| 30/08/2018 | 59.63 | 60.55 | 60.09 |
| 31/08/2018 | 59.86 | 60.53 | 60.2 |
| 03/09/2018 | 59.9 | 60.54 | 60.22 |
| 04/09/2018 | 60.16 | 60.67 | 60.42 |
| 05/09/2018 | 60.28 | 60.91 | 60.6 |
| 06/09/2018 | 60.17 | 60.72 | 60.45 |
| 10/09/2018 | 60.05 | 61.63 | 60.84 |
| 11/09/2018 | 60.31 | 61.04 | 60.68 |
| 12/09/2018 | 60.06 | 61.15 | 60.61 |
| 13/09/2018 | 60.41 | 61.18 | 60.8 |
| 14/09/2018 | 60.37 | 61.34 | 60.86 |
| 17/09/2018 | 60.51 | 61.41 | 60.96 |
| 18/09/2018 | 60.62 | 61.48 | 61.05 |
| 19/09/2018 | 60.9 | 61.79 | 61.35 |
| 20/09/2018 | 60.88 | 61.85 | 61.37 |
| 21/09/2018 | 61.09 | 61.95 | 61.52 |
| 24/09/2018 | 60.65 | 61.12 | 60.89 |
| 26/09/2018 | 61.04 | 61.14 | 61.09 |
| 27/09/2018 | 60.66 | 61.44 | 61.05 |
| 28/09/2018 | 60.36 | 61.69 | 61.03 |
| 01/10/2018 | 60.44 | 61.28 | 60.86 |
| 02/10/2018 | 60.46 | 61.22 | 60.84 |
| 03/10/2018 | 59.97 | 61.23 | 60.6 |
| 05/10/2018 | 60.01 | 61.05 | 60.53 |
| 08/10/2018 | 60.19 | 60.73 | 60.46 |
| 09/10/2018 | 59.98 | 60.74 | 60.36 |
| 11/10/2018 | 59.97 | 60.99 | 60.48 |
| 12/10/2018 | 60.1 | 61.08 | 60.59 |
| 15/10/2018 | 60.1 | 61.05 | 60.58 |
| 16/10/2018 | 60.26 | 60.9 | 60.58 |
| 17/10/2018 | 60.03 | 60.87 | 60.45 |
| 18/10/2018 | 60.06 | 61.06 | 60.56 |
| 19/10/2018 | 60.09 | 61.05 | 60.57 |
| 22/10/2018 | 60.18 | 60.97 | 60.58 |
| 23/10/2018 | 60.13 | 61.02 | 60.58 |
| 24/10/2018 | 60.22 | 60.99 | 60.61 |
| 25/10/2018 | 60.17 | 60.82 | 60.5 |
| 26/10/2018 | 60.15 | 61.14 | 60.65 |
| 29/10/2018 | 60.18 | 61.16 | 60.67 |
| 30/10/2018 | 60.13 | 60.74 | 60.44 |
| 31/10/2018 | 60.2 | 61.19 | 60.7 |
| 01/11/2018 | 60.23 | 61.22 | 60.73 |
| 02/11/2018 | 60.23 | 61.21 | 60.72 |
| 05/11/2018 | 60.3 | 61.22 | 60.76 |
| 06/11/2018 | 60.37 | 61.16 | 60.77 |
| 07/11/2018 | 60.35 | 61.3 | 60.83 |
| 08/11/2018 | 60.49 | 61.36 | 60.93 |
| 09/11/2018 | 60.65 | 61.15 | 60.9 |
| 12/11/2018 | 60.38 | 60.76 | 60.57 |
| 13/11/2018 | 60.41 | 61.35 | 60.88 |
| 14/11/2018 | 60.53 | 61.48 | 61.01 |
| 15/11/2018 | 60.52 | 60.82 | 60.67 |
| 16/11/2018 | 60.72 | 61.51 | 61.12 |
| 19/11/2018 | 60.68 | 61.58 | 61.13 |
| 20/11/2018 | 60.79 | 61.6 | 61.2 |
| 21/11/2018 | 60.72 | 61.79 | 61.26 |
| 22/11/2018 | 60.74 | 61.78 | 61.26 |
| 23/11/2018 | 60.84 | 61.82 | 61.33 |
| 26/11/2018 | 60.74 | 61.77 | 61.26 |
| 27/11/2018 | 61.37 | 61.77 | 61.57 |
| 28/11/2018 | 60.83 | 61.31 | 61.07 |
| 29/11/2018 | 60.94 | 61.87 | 61.41 |
| 30/11/2018 | 61.07 | 61.91 | 61.49 |
| 03/12/2018 | 60.95 | 61.79 | 61.37 |
| 04/12/2018 | 61.13 | 61.91 | 61.52 |
| 05/12/2018 | 61.1 | 61.69 | 61.4 |
| 06/12/2018 | 61.08 | 61.73 | 61.41 |
| 07/12/2018 | 61.04 | 61.94 | 61.49 |
| 10/12/2018 | 61.49 | 61.8 | 61.65 |
| 11/12/2018 | 61.05 | 61.9 | 61.48 |
| 12/12/2018 | 61 | 61.88 | 61.44 |
| 13/12/2018 | 61.04 | 61.91 | 61.48 |
| 14/12/2018 | 60.99 | 61.94 | 61.47 |
| 17/12/2018 | 61.06 | 61.87 | 61.47 |
| 18/12/2018 | 61.1 | 61.91 | 61.51 |
| 19/12/2018 | 61.01 | 61.74 | 61.38 |
| 20/12/2018 | 61.09 | 61.58 | 61.34 |
| 21/12/2018 | 60.6 | 61.19 | 60.9 |
| 24/12/2018 | 60.97 | 61.79 | 61.38 |
| 26/12/2018 | 60.95 | 61.78 | 61.37 |
| 27/12/2018 | 61.09 | 61.77 | 61.43 |
| 28/12/2018 | 60.84 | 62.01 | 61.43 |
| 31/12/2018 | 60.31 | 60.49 | 61.33 |
| 02/01/2019 | 61.13 | 61.7 | 61.42 |
| 03/01/2019 | 60.94 | 61.79 | 61.37 |
| 04/01/2019 | 60.97 | 61.71 | 61.34 |
| 07/01/2019 | 61.54 | 61.87 | 61.71 |
| 08/01/2019 | 60.97 | 61.96 | 61.47 |
| 09/01/2019 | 61.04 | 62.06 | 61.55 |
| 10/01/2019 | 61.06 | 62.03 | 61.55 |
| 11/01/2019 | 61.1 | 62.07 | 61.59 |
| 14/01/2019 | 61.1 | 62.14 | 61.62 |
| 15/01/2019 | 61.23 | 62.13 | 61.68 |
| 16/01/2019 | 61.23 | 62.12 | 61.68 |
| 17/01/2019 | 61.69 | 62.32 | 62.01 |
| 18/01/2019 | 61.34 | 62.33 | 61.84 |
| 21/01/2019 | 61.27 | 62.15 | 61.71 |
| 22/01/2019 | 61.24 | 62.34 | 61.79 |
| 23/01/2019 | 61.4 | 62.37 | 61.89 |
| 24/01/2019 | 61.33 | 61.94 | 61.64 |
| 25/01/2019 | 61.38 | 62.14 | 61.76 |
| 28/01/2019 | 61.39 | 62.29 | 61.84 |
| 29/01/2019 | 61.44 | 62.2 | 61.82 |
| 30/01/2019 | 61.46 | 62.48 | 61.97 |
| 31/01/2019 | 61.51 | 62.57 | 62.04 |
| 01/02/2019 | 61.6 | 62.61 | 62.11 |
| 05/02/2019 | 61.65 | 62.15 | 61.9 |
| 06/02/2019 | 61.68 | 62.71 | 62.2 |
| 07/02/2019 | 61.81 | 62.69 | 62.25 |
| 08/02/2019 | 61.83 | 62.71 | 62.27 |
| 11/02/2019 | 61.86 | 62.49 | 62.18 |
| 12/02/2019 | 62.04 | 62.94 | 62.49 |
| 13/02/2019 | 61.94 | 62.9 | 62.42 |
| 14/02/2019 | 61.94 | 62.99 | 62.47 |
| 15/02/2019 | 61.99 | 63.03 | 62.51 |
| 18/02/2019 | 62.04 | 62.91 | 62.48 |
| 19/02/2019 | 62 | 62.66 | 62.33 |
| 20/02/2019 | 62.04 | 62.82 | 62.44 |
| 21/02/2019 | 61.98 | 63.18 | 62.58 |
| 22/02/2019 | 62.03 | 63.08 | 62.56 |
| 25/02/2019 | 62.01 | 62.65 | 62.33 |
| 26/02/2019 | 62.09 | 63.11 | 62.6 |
| 27/02/2019 | 62.16 | 62.93 | 62.55 |
| 28/02/2019 | 62.15 | 62.91 | 62.53 |
| 01/03/2019 | 62.23 | 63.24 | 62.74 |
| 04/03/2019 | 62.2 | 63.26 | 62.73 |
| 05/03/2019 | 62.27 | 63.29 | 62.78 |
| 06/03/2019 | 62.25 | 63.37 | 62.81 |
| 07/03/2019 | 62.28 | 63.06 | 62.67 |
| 08/03/2019 | 62.18 | 63.02 | 62.6 |
| 11/03/2019 | 62.53 | 62.78 | 62.66 |
| 12/03/2019 | 62.25 | 63.03 | 62.64 |
| 13/03/2019 | 62.26 | 63.15 | 62.71 |
| 14/03/2019 | 62.39 | 63.39 | 62.89 |
| 15/03/2019 | 62.31 | 63.33 | 62.82 |
| 18/03/2019 | 62.44 | 63.39 | 62.92 |
| 19/03/2019 | 62.63 | 63.55 | 63.09 |
| 20/03/2019 | 62.74 | 63.24 | 62.99 |
| 21/03/2019 | 62.95 | 63.77 | 63.36 |
| 22/03/2019 | 63.06 | 63.75 | 63.41 |
| 25/03/2019 | 63.13 | 63.87 | 63.5 |
| 26/03/2019 | 63.15 | 63.64 | 63.4 |
| 27/03/2019 | 63.03 | 63.91 | 63.47 |
| 28/03/2019 | 63.37 | 63.81 | 63.59 |
| 29/03/2019 | 63.4 | 64.3 | 63.85 |
| 01/04/2019 | 63.58 | 64.02 | 63.8 |
| 02/04/2019 | 63.51 | 64.37 | 63.94 |
| 03/04/2019 | 63.52 | 64.47 | 64 |
| 04/04/2019 | 63.65 | 64.21 | 63.93 |
| 05/04/2019 | 63.61 | 64.15 | 63.88 |
| 09/04/2019 | 63.65 | 64.47 | 64.06 |
| 10/04/2019 | 63.67 | 64.75 | 64.21 |
| 11/04/2019 | 63.7 | 64.75 | 64.23 |
| 12/04/2019 | 63.72 | 64.77 | 64.25 |
| 15/04/2019 | 63.78 | 64.54 | 64.16 |
| 16/04/2019 | 63.93 | 64.71 | 64.32 |
| 17/04/2019 | 64.02 | 64.84 | 64.43 |
| 18/04/2019 | 64.08 | 64.83 | 64.46 |
| 22/04/2019 | 64.08 | 64.81 | 64.45 |
| 23/04/2019 | 64.13 | 65.13 | 64.63 |
| 24/04/2019 | 64.27 | 65.06 | 64.67 |
| 25/04/2019 | 64.1 | 64.76 | 64.43 |
| 26/04/2019 | 63.93 | 64.83 | 64.38 |
| 29/04/2019 | 63.98 | 64.58 | 64.28 |
| 30/04/2019 | 63.89 | 64.95 | 64.42 |
| 02/05/2019 | 63.7 | 64.77 | 64.24 |
| 03/05/2019 | 63.7 | 64.67 | 64.19 |
| 06/05/2019 | 63.6 | 64.46 | 64.03 |
| 07/05/2019 | 63.59 | 64.41 | 64 |
| 08/05/2019 | 63.43 | 64.37 | 63.9 |
| 09/05/2019 | 63.4 | 64.2 | 63.8 |
| 10/05/2019 | 63.21 | 64.2 | 63.71 |
| 13/05/2019 | 63.26 | 64.14 | 63.7 |
| 14/05/2019 | 63.23 | 63.97 | 63.6 |
| 15/05/2019 | 63.18 | 64.07 | 63.63 |
| 16/05/2019 | 62.96 | 63.81 | 63.39 |
| 17/05/2019 | 62.9 | 63.85 | 63.38 |
| 20/05/2019 | 62.93 | 63.66 | 63.3 |
| 21/05/2019 | 62.68 | 63.63 | 63.16 |
| 22/05/2019 | 62.14 | 63.23 | 62.69 |
| 23/05/2019 | 62.02 | 62.99 | 62.51 |
| 24/05/2019 | 61.85 | 62.9 | 62.38 |
| 27/05/2019 | 61.71 | 62.92 | 62.32 |
| 28/05/2019 | 61.71 | 62.6 | 62.16 |
| 29/05/2019 | 61.78 | 62.54 | 62.16 |
| 30/05/2019 | 61.65 | 62.46 | 62.06 |
| 31/05/2019 | 61.9 | 62.26 | 62.08 |
| 03/06/2019 | 61.6 | 62.47 | 62.04 |
| 04/06/2019 | 61.62 | 62.42 | 62.02 |
| 05/06/2019 | 61.67 | 62.38 | 62.03 |
| 06/06/2019 | 61.67 | 62.51 | 62.09 |
| 07/06/2019 | 61.66 | 62.35 | 62.01 |
| 10/06/2019 | 61.61 | 62.4 | 62.01 |
| 11/06/2019 | 61.62 | 62.44 | 62.03 |
| 12/06/2019 | 61.73 | 62.22 | 61.98 |
| 13/06/2019 | 61.43 | 62.33 | 61.88 |
| 14/06/2019 | 61.37 | 62.26 | 61.82 |
| 17/06/2019 | 61.37 | 62.12 | 61.75 |
| 18/06/2019 | 61.36 | 62.12 | 61.74 |
| 19/06/2019 | 61.45 | 62.12 | 61.79 |
| 20/06/2019 | 61.43 | 62.19 | 61.81 |
| 21/06/2019 | 61.45 | 62.24 | 61.85 |
| 24/06/2019 | 61.49 | 62.19 | 61.84 |
| 26/06/2019 | 61.53 | 62.27 | 61.9 |
| 27/06/2019 | 61.57 | 62.42 | 62 |
| 28/06/2019 | 61.56 | 62.34 | 61.95 |
| 01/07/2019 | 61.64 | 62.42 | 62.03 |
| 02/07/2019 | 61.72 | 62.52 | 62.12 |
| 03/07/2019 | 61.59 | 62.51 | 62.05 |
| 04/07/2019 | 61.62 | 62.55 | 62.09 |
| 05/07/2019 | 61.66 | 62.52 | 62.09 |
| 08/07/2019 | 61.63 | 62.75 | 62.19 |
| 09/07/2019 | 61.63 | 62.5 | 62.07 |
| 10/07/2019 | 61.66 | 62.5 | 62.08 |
| 11/07/2019 | 61.62 | 62.8 | 62.21 |
| 12/07/2019 | 61.62 | 62.44 | 62.03 |
| 15/07/2019 | 61.55 | 62.15 | 61.85 |
| 16/07/2019 | 61.39 | 62.24 | 61.82 |
| 17/07/2019 | 61.38 | 62.19 | 61.79 |
| 18/07/2019 | 61.31 | 62.17 | 61.74 |
| 19/07/2019 | 61.37 | 62.08 | 61.73 |
| 22/07/2019 | 61.27 | 62.04 | 61.66 |
| 23/07/2019 | 61.3 | 62.08 | 61.69 |
| 24/07/2019 | 61.3 | 61.94 | 61.62 |
| 25/07/2019 | 61.27 | 62.12 | 61.7 |
| 26/07/2019 | 61.13 | 61.89 | 61.51 |
| 29/07/2019 | 60.98 | 61.64 | 61.31 |
| 30/07/2019 | 60.99 | 61.71 | 61.35 |
| 31/07/2019 | 60.86 | 61.56 | 61.21 |
| 01/08/2019 | 60.68 | 61.4 | 61.04 |
| 02/08/2019 | 60.7 | 61.29 | 61 |
| 05/08/2019 | 60.66 | 61.01 | 60.84 |
| 06/08/2019 | 60.48 | 61.08 | 60.78 |
| 07/08/2019 | 60.31 | 61 | 60.66 |
| 08/08/2019 | 60.12 | 60.75 | 60.44 |
| 09/08/2019 | 59.97 | 61 | 60.49 |
| 12/08/2019 | 59.99 | 60.76 | 60.38 |
| 13/08/2019 | 59.91 | 60.68 | 60.3 |
| 14/08/2019 | 59.91 | 60.78 | 60.35 |
| 15/08/2019 | 60 | 60.85 | 60.43 |
| 16/08/2019 | 60.04 | 60.82 | 60.43 |
| 19/08/2019 | 60.02 | 61.06 | 60.54 |
| 20/08/2019 | 60.14 | 61.06 | 60.6 |
| 21/08/2019 | 60.15 | 61.17 | 60.66 |
| 22/08/2019 | 60.2 | 61.28 | 60.74 |
| 23/08/2019 | 60.51 | 61.45 | 60.98 |
| 26/08/2019 | 60.41 | 61.44 | 60.93 |
| 27/08/2019 | 60.43 | 61.61 | 61.02 |
| 28/08/2019 | 60.52 | 61.7 | 61.11 |
| 29/08/2019 | 60.72 | 61.72 | 61.22 |
| 30/08/2019 | 60.7 | 61.77 | 61.24 |
| 02/09/2019 | 60.9 | 61.85 | 61.38 |
| 03/09/2019 | 60.86 | 62.03 | 61.45 |
| 04/09/2019 | 60.95 | 62.08 | 61.52 |
| 05/09/2019 | 60.96 | 62.03 | 61.5 |
| 09/09/2019 | 61.03 | 62.18 | 61.61 |
| 10/09/2019 | 61.08 | 62.23 | 61.66 |
| 11/09/2019 | 61.07 | 62.26 | 61.67 |
| 12/09/2019 | 61.16 | 62.27 | 61.72 |
| 13/09/2019 | 61.18 | 62.28 | 61.73 |
| 16/09/2019 | 61.15 | 62.34 | 61.75 |
| 17/09/2019 | 61.16 | 62.32 | 61.74 |
| 18/09/2019 | 61.17 | 62.33 | 61.75 |
| 19/09/2019 | 61.2 | 62.34 | 61.77 |
| 20/09/2019 | 61.2 | 62.26 | 61.73 |
| 23/09/2019 | 61.29 | 62.34 | 61.82 |
| 24/09/2019 | 61.36 | 62.45 | 61.91 |
| 26/09/2019 | 61.31 | 62.41 | 61.86 |
| 27/09/2019 | 61.33 | 62.49 | 61.91 |
| 30/09/2019 | 61.31 | 62.46 | 61.89 |
| 01/10/2019 | 61.43 | 62.46 | 61.95 |
| 02/10/2019 | 61.39 | 62.48 | 61.94 |
| 03/10/2019 | 61.37 | 62.55 | 61.96 |
| 07/10/2019 | 61.45 | 62.52 | 61.99 |
| 08/10/2019 | 61.45 | 62.61 | 62.03 |
| 09/10/2019 | 61.53 | 62.57 | 62.05 |
| 10/10/2019 | 61.61 | 62.62 | 62.12 |
| 11/10/2019 | 61.66 | 62.7 | 62.18 |
| 14/10/2019 | 61.58 | 62.69 | 62.14 |
| 16/10/2019 | 61.79 | 62.66 | 62.23 |
| 17/10/2019 | 61.81 | 62.87 | 62.34 |
| 18/10/2019 | 61.77 | 62.88 | 62.33 |
| 21/10/2019 | 61.84 | 62.88 | 62.36 |
| 22/10/2019 | 61.84 | 62.91 | 62.38 |
| 23/10/2019 | 61.85 | 62.98 | 62.42 |
| 24/10/2019 | 61.77 | 63.07 | 62.42 |
| 25/10/2019 | 62.01 | 63.13 | 62.57 |
| 28/10/2019 | 62.08 | 63.11 | 62.6 |
| 29/10/2019 | 62.08 | 63.17 | 62.63 |
| 30/10/2019 | 62.16 | 63.28 | 62.72 |
| 31/10/2019 | 62.27 | 63.22 | 62.75 |
| 01/11/2019 | 62.34 | 63.39 | 62.87 |
| 04/11/2019 | 62.3 | 63.46 | 62.88 |
| 05/11/2019 | 62.37 | 63.45 | 62.91 |
| 06/11/2019 | 62.42 | 63.49 | 62.96 |
| 07/11/2019 | 62.43 | 63.3 | 62.87 |
| 08/11/2019 | 62.52 | 63.68 | 63.1 |
| 11/11/2019 | 62.55 | 63.58 | 63.07 |
| 12/11/2019 | 62.65 | 63.68 | 63.17 |
| 13/11/2019 | 62.71 | 63.74 | 63.23 |
| 14/11/2019 | 62.71 | 63.82 | 63.27 |
| 15/11/2019 | 62.78 | 63.87 | 63.33 |
| 18/11/2019 | 62.94 | 64.01 | 63.48 |
| 19/11/2019 | 63.15 | 64.17 | 63.66 |
| 20/11/2019 | 63.22 | 64.31 | 63.77 |
| 21/11/2019 | 63.39 | 64.29 | 63.84 |
| 22/11/2019 | 63.34 | 64.37 | 63.86 |
| 25/11/2019 | 63.28 | 64.29 | 63.79 |
| 26/11/2019 | 63.38 | 64.36 | 63.87 |
| 27/11/2019 | 63.44 | 64.49 | 63.97 |
| 28/11/2019 | 63.49 | 64.52 | 64.01 |
| 29/11/2019 | 63.46 | 64.44 | 63.95 |
| 02/12/2019 | 63.45 | 64.39 | 63.92 |
| 03/12/2019 | 63.43 | 64.38 | 63.91 |
| 04/12/2019 | 63.51 | 64.48 | 64 |
| 05/12/2019 | 63.44 | 64.37 | 63.91 |
| 06/12/2019 | 63.35 | 64.21 | 63.78 |
| 09/12/2019 | 63.28 | 64.12 | 63.7 |
| 10/12/2019 | 63.3 | 63.98 | 63.64 |
| 11/12/2019 | 63.14 | 64.09 | 63.62 |
| 12/12/2019 | 63.06 | 63.74 | 63.4 |
| 13/12/2019 | 63.02 | 63.85 | 63.44 |
| 16/12/2019 | 62.84 | 63.74 | 63.29 |
| 17/12/2019 | 62.68 | 63.38 | 63.03 |
| 18/12/2019 | 62.52 | 63.39 | 62.96 |
| 19/12/2019 | 62.21 | 63.11 | 62.66 |
| 20/12/2019 | 61.81 | 62.85 | 62.33 |
| 23/12/2019 | 61.63 | 62.59 | 62.11 |
| 24/12/2019 | 61.25 | 62.36 | 61.81 |
| 26/12/2019 | 61.1 | 61.91 | 61.51 |
| 27/12/2019 | 60.93 | 61.67 | 61.3 |
| 30/12/2019 | 60.86 | 62.39 | 61.63 |
| 31/12/2019 | 61.16 | 61.88 | 61.52 |
| 02/01/2020 | 61.12 | 61.87 | 61.5 |
| 03/01/2020 | 60.93 | 62.08 | 61.51 |
| 06/01/2020 | 61.01 | 62.22 | 61.62 |
| 07/01/2020 | 61.13 | 62.28 | 61.71 |
| 08/01/2020 | 61.24 | 62.17 | 61.71 |
| 09/01/2020 | 61.42 | 62.48 | 61.95 |
| 10/01/2020 | 61.49 | 62.56 | 62.03 |
| 13/01/2020 | 61.61 | 62.69 | 62.15 |
| 14/01/2020 | 61.66 | 62.78 | 62.22 |
| 16/01/2020 | 61.77 | 62.76 | 62.27 |
| 17/01/2020 | 61.91 | 62.99 | 62.45 |
| 20/01/2020 | 62.07 | 62.86 | 62.47 |
| 21/01/2020 | 62.29 | 63.36 | 62.83 |
| 22/01/2020 | 62.53 | 63.51 | 63.02 |
| 23/01/2020 | 62.67 | 63.67 | 63.17 |
| 24/01/2020 | 62.8 | 63.78 | 63.29 |
| 27/01/2020 | 63.13 | 63.95 | 63.54 |
| 28/01/2020 | 63.13 | 64.14 | 63.64 |
| 29/01/2020 | 63.18 | 64.25 | 63.72 |
| 30/01/2020 | 63.27 | 64.33 | 63.8 |
| 31/01/2020 | 63.3 | 64.3 | 63.8 |
| 04/02/2020 | 63.29 | 64.31 | 63.8 |
| 05/02/2020 | 63.42 | 64.52 | 63.97 |
| 06/02/2020 | 63.47 | 64.55 | 64.01 |
| 07/02/2020 | 63.53 | 64.59 | 64.06 |
| 10/02/2020 | 63.54 | 64.69 | 64.12 |
| 11/02/2020 | 63.62 | 64.64 | 64.13 |
| 12/02/2020 | 63.7 | 64.84 | 64.27 |
| 13/02/2020 | 63.99 | 64.7 | 64.35 |
| 14/02/2020 | 63.78 | 64.95 | 64.37 |
| 17/02/2020 | 63.89 | 65 | 64.45 |
| 18/02/2020 | 63.99 | 65.1 | 64.55 |
| 19/02/2020 | 64.09 | 65.16 | 64.63 |
| 20/02/2020 | 64.21 | 65.32 | 64.77 |
| 21/02/2020 | 64.26 | 65.44 | 64.85 |
| 24/02/2020 | 64.28 | 65.46 | 64.87 |
| 25/02/2020 | 64.46 | 65.47 | 64.97 |
| 26/02/2020 | 64.54 | 65.64 | 65.09 |
| 27/02/2020 | 64.61 | 65.66 | 65.14 |
| 28/02/2020 | 64.67 | 65.8 | 65.24 |
| 02/03/2020 | 64.75 | 65.76 | 65.26 |
| 03/03/2020 | 64.79 | 65.9 | 65.35 |
| 04/03/2020 | 64.86 | 66.03 | 65.45 |
| 05/03/2020 | 64.91 | 66.09 | 65.5 |
| 06/03/2020 | 65.01 | 66.14 | 65.58 |
| 09/03/2020 | 64.97 | 65.94 | 65.46 |
| 10/03/2020 | 65.06 | 66.26 | 65.66 |
| 11/03/2020 | 65.09 | 66.26 | 65.68 |
| 12/03/2020 | 65.35 | 66.43 | 65.89 |
| 13/03/2020 | 65.24 | 66.41 | 65.83 |
| 16/03/2020 | 65.37 | 66.36 | 65.87 |
| 17/03/2020 | 65.52 | 66.67 | 66.1 |
| 18/03/2020 | 65.71 | 66.85 | 66.28 |
| 19/03/2020 | 65.7 | 66.92 | 66.31 |
| 20/03/2020 | 65.71 | 66.63 | 66.17 |
| 23/03/2020 | 65.75 | 66.96 | 66.36 |
| 24/03/2020 | 65.86 | 67.09 | 66.48 |
| 25/03/2020 | 65.96 | 67.08 | 66.52 |
| 26/03/2020 | 65.93 | 67.16 | 66.55 |
| 27/03/2020 | 65.94 | 67.18 | 66.56 |
| 30/03/2020 | 66.05 | 67.24 | 66.65 |
| 31/03/2020 | 66.04 | 67.29 | 66.67 |
| 01/04/2020 | 66.14 | 67.3 | 66.72 |
| 02/04/2020 | 66.11 | 67.44 | 66.78 |
| 03/04/2020 | 66.15 | 67.31 | 66.73 |
| 06/04/2020 | 66.23 | 67.34 | 66.79 |
| 08/04/2020 | 66.31 | 67.53 | 66.92 |
| 09/04/2020 | 66.33 | 67.56 | 66.95 |
| 13/04/2020 | 66.49 | 67.62 | 67.06 |
| 14/04/2020 | 66.54 | 67.77 | 67.16 |
| 15/04/2020 | 66.52 | 67.75 | 67.14 |
| 16/04/2020 | 66.54 | 67.78 | 67.16 |
| 17/04/2020 | 66.58 | 67.87 | 67.23 |
| 20/04/2020 | 66.73 | 67.84 | 67.29 |
| 21/04/2020 | 66.74 | 67.92 | 67.33 |
| 22/04/2020 | 66.75 | 68.01 | 67.38 |
| 23/04/2020 | 66.84 | 68.06 | 67.45 |
| 24/04/2020 | 66.74 | 68.18 | 67.46 |
| 27/04/2020 | 66.96 | 68.2 | 67.58 |
| 28/04/2020 | 67.04 | 68.33 | 67.69 |
| 29/04/2020 | 67.09 | 68.38 | 67.74 |
| 30/04/2020 | 67.15 | 68.4 | 67.78 |
| 04/05/2020 | 67.22 | 68.37 | 67.8 |
| 05/05/2020 | 67.29 | 68.54 | 67.92 |
| 06/05/2020 | 67.35 | 68.57 | 67.96 |
| 07/05/2020 | 67.52 | 68.64 | 68.08 |
| 08/05/2020 | 67.48 | 67.17 | 67.33 |
| 11/05/2020 | 67.44 | 68.64 | 68.04 |
| 12/05/2020 | 67.53 | 68.8 | 68.17 |
| 13/05/2020 | 67.61 | 68.82 | 68.22 |
| 14/05/2020 | 67.85 | 68.83 | 68.34 |
| 15/05/2020 | 67.87 | 69.08 | 68.48 |
| 18/05/2020 | 67.93 | 69.07 | 68.5 |
| 19/05/2020 | 68.13 | 68.97 | 68.55 |
| 20/05/2020 | 68.1 | 69.4 | 68.75 |
| 21/05/2020 | 68.19 | 69.41 | 68.8 |
| 22/05/2020 | 68.18 | 69.46 | 68.82 |
| 25/05/2020 | 68.29 | 69.48 | 68.89 |
| 26/05/2020 | 68.36 | 69.62 | 68.99 |
| 27/05/2020 | 68.48 | 69.79 | 69.14 |
| 28/05/2020 | 68.56 | 69.83 | 69.2 |
| 29/05/2020 | 68.65 | 69.82 | 69.24 |
| 01/06/2020 | 68.7 | 69.95 | 69.33 |
| 02/06/2020 | 68.63 | 69.96 | 69.3 |
| 03/06/2020 | 68.71 | 70.02 | 69.37 |
| 04/06/2020 | 68.75 | 69.97 | 69.36 |
| 05/06/2020 | 68.8 | 70.03 | 69.42 |
| 08/06/2020 | 68.87 | 70.06 | 69.47 |
| 09/06/2020 | 68.89 | 70.19 | 69.54 |
| 10/06/2020 | 68.92 | 70.11 | 69.52 |
| 11/06/2020 | 68.99 | 70.19 | 69.59 |
| 12/06/2020 | 69.07 | 70.28 | 69.68 |
| 15/06/2020 | 69.03 | 70.31 | 69.67 |
| 16/06/2020 | 69.09 | 70.26 | 69.68 |
| 17/06/2020 | 69.14 | 70.44 | 69.79 |
| 18/06/2020 | 69.15 | 70.46 | 69.81 |
| 19/06/2020 | 69.31 | 70.39 | 69.85 |
| 22/06/2020 | 69.23 | 70.51 | 69.87 |
| 23/06/2020 | 69.33 | 70.45 | 69.89 |
| 24/06/2020 | 69.31 | 70.62 | 69.97 |
| 26/06/2020 | 69.37 | 69.01 | 69.19 |
| 29/06/2020 | 69.49 | 70.69 | 70.09 |
| 30/06/2020 | 69.45 | 70.76 | 70.11 |
| 01/07/2020 | 69.5 | 70.76 | 70.13 |
| 02/07/2020 | 69.46 | 70.77 | 70.12 |
| 03/07/2020 | 69.64 | 70.79 | 70.22 |
| 06/07/2020 | 69.5 | 70.79 | 70.15 |
| 07/07/2020 | 69.59 | 70.82 | 70.21 |
| 08/07/2020 | 69.61 | 70.92 | 70.27 |
| 09/07/2020 | 69.68 | 70.88 | 70.28 |
| 10/07/2020 | 69.75 | 70.59 | 70.17 |
| 13/07/2020 | 69.68 | 70.99 | 70.34 |
| 14/07/2020 | 69.73 | 70.85 | 70.29 |
| 15/07/2020 | 69.81 | 71.06 | 70.44 |
| 16/07/2020 | 69.81 | 71.09 | 70.45 |
| 17/07/2020 | 69.89 | 71.11 | 70.5 |
| 20/07/2020 | 69.85 | 71.06 | 70.46 |
| 21/07/2020 | 69.93 | 71.24 | 70.59 |
| 22/07/2020 | 69.92 | 71.23 | 70.58 |
| 23/07/2020 | 69.99 | 71.24 | 70.62 |
| 24/07/2020 | 70.02 | 71.23 | 70.63 |
| 27/07/2020 | 70 | 71.24 | 70.62 |
| 28/07/2020 | 70.09 | 71.38 | 70.74 |
| 29/07/2020 | 70.11 | 71.43 | 70.77 |
| 30/07/2020 | 70.16 | 71.47 | 70.82 |
| 31/07/2020 | 70.22 | 71.45 | 70.84 |
| 03/08/2020 | 70.28 | 71.44 | 70.86 |
| 04/08/2020 | 70.28 | 71.62 | 70.95 |
| 05/08/2020 | 70.34 | 71.63 | 70.99 |
| 06/08/2020 | 70.36 | 71.49 | 70.93 |
| 07/08/2020 | 70.36 | 71.64 | 71 |
| 10/08/2020 | 70.39 | 71.67 | 71.03 |
| 11/08/2020 | 70.46 | 71.76 | 71.11 |
| 12/08/2020 | 70.52 | 71.73 | 71.13 |
| 13/08/2020 | 70.48 | 71.79 | 71.14 |
| 14/08/2020 | 70.52 | 71.8 | 71.16 |
| 17/08/2020 | 70.54 | 71.72 | 71.13 |
| 18/08/2020 | 70.56 | 71.88 | 71.22 |
| 19/08/2020 | 70.7 | 71.98 | 71.34 |
| 20/08/2020 | 70.67 | 71.63 | 71.15 |
| 21/08/2020 | 70.74 | 72.02 | 71.38 |
| 24/08/2020 | 70.72 | 72 | 71.36 |
| 25/08/2020 | 70.78 | 72.13 | 71.46 |
| 26/08/2020 | 70.81 | 72.12 | 71.47 |
| 27/08/2020 | 70.9 | 72.25 | 71.58 |
| 28/08/2020 | 71.02 | 72.23 | 71.63 |
| 31/08/2020 | 70.95 | 72.3 | 71.63 |
| 01/09/2020 | 71 | 72.33 | 71.67 |
| 02/09/2020 | 70.99 | 72.11 | 71.55 |
| 03/09/2020 | 71.05 | 72.35 | 71.7 |
| 04/09/2020 | 71.09 | 72.42 | 71.76 |
| 08/09/2020 | 71.06 | 72.36 | 71.71 |
| 09/09/2020 | 71.08 | 72.4 | 71.74 |
| 10/09/2020 | 71.15 | 72.43 | 71.79 |
| 11/09/2020 | 71.14 | 72.49 | 71.82 |
| 14/09/2020 | 71.15 | 72.44 | 71.8 |
| 15/09/2020 | 71.19 | 72.44 | 71.82 |
| 16/09/2020 | 71.19 | 72.54 | 71.87 |
| 17/09/2020 | 71.21 | 72.55 | 71.88 |
| 18/09/2020 | 71.24 | 72.56 | 71.9 |
| 21/09/2020 | 71.23 | 72.55 | 71.89 |
| 22/09/2020 | 71.36 | 72.58 | 71.97 |
| 23/09/2020 | 71.33 | 72.68 | 72.01 |
| 24/09/2020 | 71.38 | 72.72 | 72.05 |
| 28/09/2020 | 71.46 | 72.74 | 72.1 |
| 29/09/2020 | 71.58 | 72.93 | 72.26 |
| 30/09/2020 | 71.68 | 72.96 | 72.29 |
| 01/10/2020 | 71.71 | 72.99 | 72.35 |
| 02/10/2020 | 71.89 | 73.09 | 72.49 |
| 06/10/2020 | 71.81 | 72.92 | 72.37 |
| 07/10/2020 | 71.84 | 73.16 | 72.5 |
| 08/10/2020 | 71.91 | 73.24 | 72.58 |
| 09/10/2020 | 71.9 | 73.24 | 72.57 |
| 12/10/2020 | 71.93 | 73.09 | 72.51 |
| 13/10/2020 | 71.99 | 73.33 | 72.66 |
| 14/10/2020 | 72.16 | 73.44 | 72.8 |
| 15/10/2020 | 72.1 | 73.33 | 72.72 |
| 16/10/2020 | 72.15 | 73.45 | 72.8 |
| 19/10/2020 | 72.18 | 73.57 | 72.88 |
| 20/10/2020 | 72.23 | 73.1 | 72.67 |
| 21/10/2020 | 72.24 | 73.48 | 72.86 |
| 22/10/2020 | 72.42 | 73.63 | 73.03 |
| 23/10/2020 | 72.29 | 73.35 | 72.82 |
| 26/10/2020 | 72.35 | 73.56 | 72.96 |
| 27/10/2020 | 72.4 | 73.65 | 73.03 |
| 28/10/2020 | 72.47 | 73.75 | 73.11 |
| 29/10/2020 | 72.52 | 73.87 | 73.2 |
| 30/10/2020 | 72.78 | 73.87 | 73.33 |
| 02/11/2020 | 72.58 | 73.89 | 73.24 |
| 03/11/2020 | 72.66 | 73.9 | 73.28 |
| 04/11/2020 | 72.64 | 73.99 | 73.32 |
| 05/11/2020 | 72.65 | 73.99 | 73.32 |
| 06/11/2020 | 72.64 | 74.07 | 73.36 |
| 09/11/2020 | 72.72 | 74.09 | 73.41 |
| 11/11/2020 | 72.75 | 74.08 | 73.42 |
| 12/11/2020 | 72.85 | 74.18 | 73.52 |
| 13/11/2020 | 73.03 | 74.31 | 73.67 |
| 16/11/2020 | 72.99 | 74.25 | 73.62 |
| 17/11/2020 | 73.05 | 74.41 | 73.73 |
| 18/11/2020 | 73.15 | 74.4 | 73.78 |
| 19/11/2020 | 73.16 | 74.54 | 73.85 |
| 20/11/2020 | 73.16 | 74.49 | 73.83 |
| 23/11/2020 | 73.27 | 74.5 | 73.89 |
| 24/11/2020 | 73.33 | 74.59 | 73.96 |
| 25/11/2020 | 73.46 | 74.79 | 74.13 |
| 26/11/2020 | 73.48 | 74.71 | 74.1 |
| 27/11/2020 | 73.47 | 74.85 | 74.16 |
| 30/11/2020 | 73.53 | 74.73 | 74.13 |
| 01/12/2020 | 73.54 | 74.88 | 74.21 |
| 02/12/2020 | 73.72 | 74.95 | 74.34 |
| 03/12/2020 | 73.62 | 74.91 | 74.27 |
| 04/12/2020 | 73.71 | 74.88 | 74.3 |
| 07/12/2020 | 73.61 | 74.92 | 74.27 |
| 08/12/2020 | 73.65 | 75.05 | 74.35 |
| 09/12/2020 | 73.83 | 75.12 | 74.48 |
| 10/12/2020 | 73.74 | 74.92 | 74.33 |
| 11/12/2020 | 73.84 | 75.15 | 74.5 |
| 14/12/2020 | 73.91 | 74.75 | 74.33 |
| 15/12/2020 | 73.98 | 75.34 | 74.66 |
| 16/12/2020 | 74.06 | 75.39 | 74.73 |
| 17/12/2020 | 74.08 | 75.47 | 74.78 |
| 18/12/2020 | 74.06 | 75.47 | 74.77 |
| 21/12/2020 | 74.07 | 75.42 | 74.75 |
| 22/12/2020 | 74.12 | 75.53 | 74.83 |
| 23/12/2020 | 74.08 | 75.46 | 74.77 |
| 28/12/2020 | 74.12 | 75.45 | 74.79 |
| 29/12/2020 | 74.16 | 75.49 | 74.83 |
| 30/12/2020 | 74.15 | 75.56 | 74.86 |
| 31/12/2020 | 74.19 | 75.46 | 74.83 |
| 04/01/2021 | 74.19 | 75.63 | 74.91 |
| 05/01/2021 | 74.28 | 75.58 | 74.93 |
| 06/01/2021 | 74.19 | 75.51 | 74.85 |
| 07/01/2021 | 74.22 | 75.63 | 74.93 |
| 08/01/2021 | 74.2 | 75.61 | 74.91 |
| 11/01/2021 | 74.25 | 75.64 | 74.95 |
| 12/01/2021 | 74.33 | 75.68 | 75.01 |
| 13/01/2021 | 74.32 | 75.66 | 74.99 |
| 14/01/2021 | 74.34 | 75.76 | 75.05 |
| 15/01/2021 | 74.34 | 75.72 | 75.03 |
| 18/01/2021 | 74.35 | 75.66 | 75.01 |
| 19/01/2021 | 74.39 | 75.81 | 75.1 |
| 20/01/2021 | 74.46 | 75.72 | 75.09 |
| 21/01/2021 | 74.43 | 75.8 | 75.12 |
| 22/01/2021 | 74.41 | 75.81 | 75.11 |
| 25/01/2021 | 74.43 | 75.81 | 75.12 |
| 26/01/2021 | 74.46 | 75.76 | 75.11 |
| 27/01/2021 | 74.51 | 75.92 | 75.22 |
| 28/01/2021 | 74.51 | 75.89 | 75.2 |
| 29/01/2021 | 74.57 | 75.9 | 75.24 |
| 01/02/2021 | 74.51 | 75.91 | 75.21 |
| 02/02/2021 | 74.54 | 76 | 75.27 |
| 04/02/2021 | 74.62 | 75.98 | 75.3 |
| 05/02/2021 | 74.58 | 75.94 | 75.26 |
| 08/02/2021 | 74.63 | 75.94 | 75.29 |
| 09/02/2021 | 74.65 | 75.98 | 75.32 |
| 10/02/2021 | 74.55 | 75.89 | 75.22 |
| 11/02/2021 | 74.49 | 75.96 | 75.23 |
| 12/02/2021 | 74.46 | 75.91 | 75.19 |
| 15/02/2021 | 74.49 | 75.81 | 75.15 |
| 16/02/2021 | 74.46 | 75.85 | 75.16 |
| 17/02/2021 | 74.51 | 75.82 | 75.17 |
| 18/02/2021 | 74.39 | 75.85 | 75.12 |
| 19/02/2021 | 74.4 | 75.83 | 75.12 |
| 22/02/2021 | 74.38 | 75.66 | 75.02 |
| 23/02/2021 | 74.33 | 75.69 | 75.01 |
| 24/02/2021 | 74.31 | 75.66 | 74.99 |
| 25/02/2021 | 74.2 | 75.69 | 74.95 |
| 26/02/2021 | 74.13 | 75.55 | 74.84 |
| 01/03/2021 | 74.06 | 75.41 | 74.74 |
| 02/03/2021 | 74.01 | 75.46 | 74.74 |
| 03/03/2021 | 74 | 75.4 | 74.7 |
| 04/03/2021 | 73.94 | 75.24 | 74.59 |
| 05/03/2021 | 73.86 | 75.18 | 74.52 |
| 08/03/2021 | 73.77 | 75.03 | 74.4 |
| 09/03/2021 | 73.7 | 74.86 | 74.28 |
| 10/03/2021 | 73.49 | 74.9 | 74.2 |
| 11/03/2021 | 73.34 | 74.58 | 73.96 |
| 12/03/2021 | 73.15 | 74.5 | 73.83 |
| 15/03/2021 | 72.95 | 73.75 | 73.35 |
| 16/03/2021 | 72.71 | 74.1 | 73.41 |
| 17/03/2021 | 72.19 | 73.37 | 72.78 |
| 18/03/2021 | 71.91 | 72.97 | 72.44 |
| 19/03/2021 | 71.6 | 72.91 | 72.26 |
| 22/03/2021 | 71.41 | 72.66 | 72.04 |
| 23/03/2021 | 71.04 | 72.3 | 71.67 |
| 24/03/2021 | 70.4 | 71.64 | 71.02 |
| 25/03/2021 | 70.01 | 71.18 | 70.6 |
| 26/03/2021 | 69.31 | 70.89 | 70.1 |
| 29/03/2021 | 68.65 | 69.91 | 69.28 |
| 30/03/2021 | 65.74 | 69.18 | 67.46 |
| 31/03/2021 | 66.85 | 68.32 | 67.59 |
| 01/04/2021 | 66.65 | 67.82 | 67.24 |
| 05/04/2021 | 65.88 | 67.23 | 66.56 |
| 06/04/2021 | 64.95 | 65.97 | 65.46 |
| 08/04/2021 | 63.77 | 64.62 | 64.2 |
| 09/04/2021 | 62.22 | 64.02 | 63.12 |
| 12/04/2021 | 57.34 | 59.43 | 58.39 |
| 13/04/2021 | 56.45 | 57.58 | 57.02 |
| 14/04/2021 | 55.88 | 57.28 | 56.58 |
| 15/04/2021 | 56.5 | 56.05 | 56.28 |
| 16/04/2021 | 55.44 | 56.32 | 55.88 |
| 19/04/2021 | 55.09 | 56.03 | 55.56 |
| 20/04/2021 | 55.08 | 56.09 | 55.59 |
| 21/04/2021 | 55.07 | 56.05 | 55.56 |
| 22/04/2021 | 55.12 | 56.19 | 55.66 |
| 23/04/2021 | 55.05 | 56.03 | 55.54 |
| 26/04/2021 | 55.93 | 56.7 | 56.32 |
| 27/04/2021 | 56.21 | 57.13 | 56.67 |
| 28/04/2021 | 56.82 | 57.64 | 57.23 |
| 29/04/2021 | 56.9 | 57.53 | 57.22 |
| 30/04/2021 | 57 | 58.31 | 57.66 |
| 03/05/2021 | 57.03 | 58.15 | 57.59 |
| 04/05/2021 | 57.34 | 58.43 | 57.89 |
| 05/05/2021 | 57.45 | 58.46 | 57.96 |
| 06/05/2021 | 57.48 | 58.38 | 57.93 |
| 07/05/2021 | 57.71 | 58.7 | 58.21 |
| 10/05/2021 | 57.79 | 58.68 | 58.24 |
| 11/05/2021 | 58 | 59.04 | 58.52 |
| 12/05/2021 | 58.05 | 59.37 | 58.71 |
| 13/05/2021 | 58.61 | 59.39 | 59 |
| 14/05/2021 | 58.4 | 59.5 | 58.95 |
| 17/05/2021 | 58.51 | 59.24 | 58.88 |
| 18/05/2021 | 58.69 | 59.83 | 59.26 |
| 19/05/2021 | 58.87 | 59.79 | 59.33 |
| 20/05/2021 | 59.08 | 60.17 | 59.63 |
| 21/05/2021 | 59.13 | 60.21 | 59.67 |
| 24/05/2021 | 59.31 | 60.42 | 59.87 |
| 25/05/2021 | 59.57 | 60.65 | 60.11 |
| 26/05/2021 | 59.98 | 61.05 | 60.52 |
| 27/05/2021 | 60.14 | 61.3 | 60.72 |
| 28/05/2021 | 60.23 | 61.39 | 60.81 |
| 31/05/2021 | 60.39 | 61.33 | 60.86 |
| 01/06/2021 | 60.57 | 61.57 | 61.07 |
| 02/06/2021 | 60.99 | 61.93 | 61.46 |
| 03/06/2021 | 60.92 | 62.1 | 61.51 |
| 04/06/2021 | 61.08 | 62.19 | 61.64 |
| 07/06/2021 | 61.18 | 62.23 | 61.71 |
| 08/06/2021 | 61.45 | 62.45 | 61.95 |
| 09/06/2021 | 61.59 | 62.55 | 62.07 |
| 10/06/2021 | 61.65 | 62.83 | 62.24 |
| 11/06/2021 | 61.73 | 62.86 | 62.3 |
| 14/06/2021 | 61.78 | 62.74 | 62.26 |
| 15/06/2021 | 62.12 | 63.22 | 62.67 |
| 16/06/2021 | 62.23 | 63.38 | 62.81 |
| 17/06/2021 | 62.28 | 63.47 | 62.88 |
| 18/06/2021 | 62.44 | 63.51 | 62.98 |
| 21/06/2021 | 62.51 | 63.56 | 63.04 |
| 22/06/2021 | 62.53 | 63.67 | 63.1 |
| 23/06/2021 | 62.66 | 63.76 | 63.21 |
| 24/06/2021 | 62.77 | 63.86 | 63.32 |
| 28/06/2021 | 62.86 | 63.81 | 63.34 |
| 29/06/2021 | 62.84 | 64.02 | 63.43 |
| 30/06/2021 | 62.89 | 64 | 63.45 |
| 01/07/2021 | 62.88 | 64.02 | 63.45 |
| 02/07/2021 | 62.9 | 64.12 | 63.51 |
| 05/07/2021 | 63.03 | 64.11 | 63.57 |
| 06/07/2021 | 62.96 | 64.15 | 63.56 |
| 07/07/2021 | 62.93 | 64.14 | 63.54 |
| 08/07/2021 | 62.93 | 64.16 | 63.55 |
| 09/07/2021 | 63.01 | 64.18 | 63.6 |
| 12/07/2021 | 63.1 | 64.09 | 63.6 |
| 13/07/2021 | 62.96 | 64.16 | 63.56 |
| 14/07/2021 | 63.06 | 64.12 | 63.59 |
| 15/07/2021 | 63.01 | 64.13 | 63.57 |
| 16/07/2021 | 63.04 | 64.08 | 63.56 |
| 19/07/2021 | 63.02 | 64.09 | 63.56 |
| 20/07/2021 | 63 | 64.22 | 63.61 |
| 21/07/2021 | 63.02 | 64.19 | 63.61 |
| 22/07/2021 | 63.01 | 64.21 | 63.61 |
| 23/07/2021 | 63.04 | 64.24 | 63.64 |
| 26/07/2021 | 63.02 | 64.23 | 63.63 |
| 27/07/2021 | 63 | 64.23 | 63.62 |
| 28/07/2021 | 63.02 | 64.25 | 63.64 |
| 29/07/2021 | 63.03 | 64.26 | 63.65 |
| 30/07/2021 | 63 | 64.24 | 63.62 |
| 02/08/2021 | 63.02 | 64.22 | 63.62 |
| 03/08/2021 | 63.02 | 64.26 | 63.64 |
| 04/08/2021 | 63.02 | 64.23 | 63.63 |
| 05/08/2021 | 63.01 | 63.88 | 63.45 |
| 06/08/2021 | 63.06 | 64.18 | 63.62 |
| 09/08/2021 | 63.04 | 64.15 | 63.6 |
| 10/08/2021 | 63.04 | 64.24 | 63.64 |
| 11/08/2021 | 63.04 | 64.27 | 63.66 |
| 12/08/2021 | 63.05 | 64.18 | 63.62 |
| 13/08/2021 | 63.1 | 64.16 | 63.63 |
| 16/08/2021 | 63.08 | 64.04 | 63.56 |
| 17/08/2021 | 63.06 | 64.24 | 63.65 |
| 18/08/2021 | 63.07 | 64.2 | 63.64 |
| 19/08/2021 | 63.08 | 64.27 | 63.68 |
| 20/08/2021 | 63.07 | 64.27 | 63.67 |
| 23/08/2021 | 63.08 | 64.21 | 63.65 |
| 24/08/2021 | 63.09 | 64.28 | 63.69 |
| 25/08/2021 | 63.11 | 64.26 | 63.69 |
| 26/08/2021 | 63.13 | 64.31 | 63.72 |
| 27/08/2021 | 63.12 | 64.29 | 63.71 |
| 30/08/2021 | 63.13 | 64.23 | 63.68 |
| 31/08/2021 | 63.14 | 64.3 | 63.72 |
| 01/09/2021 | 63.18 | 64.38 | 63.78 |
| 02/09/2021 | 63.15 | 64.33 | 63.74 |
| 03/09/2021 | 63.17 | 64.43 | 63.8 |
| 06/09/2021 | 63.19 | 64.23 | 63.71 |
| 08/09/2021 | 63.16 | 64.4 | 63.78 |
| 09/09/2021 | 63.21 | 64.3 | 63.76 |
| 10/09/2021 | 63.16 | 64.36 | 63.76 |
| 13/09/2021 | 63.16 | 64.3 | 63.73 |
| 14/09/2021 | 63.18 | 64.39 | 63.79 |
| 15/09/2021 | 63.2 | 64.4 | 63.8 |
| 16/09/2021 | 63.21 | 64.42 | 63.82 |
| 17/09/2021 | 63.2 | 64.41 | 63.81 |
| 20/09/2021 | 63.24 | 64.38 | 63.81 |
| 21/09/2021 | 63.2 | 64.41 | 63.81 |
| 22/09/2021 | 63.21 | 64.37 | 63.79 |
| 23/09/2021 | 63.21 | 64.46 | 63.84 |
| 24/09/2021 | 63.22 | 64.38 | 63.8 |
| 27/09/2021 | 63.21 | 64.42 | 63.82 |
| 28/09/2021 | 63.21 | 64.46 | 63.84 |
| 29/09/2021 | 63.2 | 64.42 | 63.81 |
| 30/09/2021 | 63.21 | 64.39 | 63.8 |
| 01/10/2021 | 63.2 | 64.45 | 63.83 |
| 05/10/2021 | 63.2 | 64.32 | 63.76 |
| 06/10/2021 | 63.23 | 64.4 | 63.82 |
| 07/10/2021 | 63.21 | 64.43 | 63.82 |
| 08/10/2021 | 63.22 | 64.31 | 63.77 |
| 11/10/2021 | 63.23 | 64.38 | 63.81 |
| 12/10/2021 | 63.22 | 64.41 | 63.82 |
| 13/10/2021 | 63.22 | 64.42 | 63.82 |
| 14/10/2021 | 63.21 | 64.42 | 63.82 |
| 15/10/2021 | 63.22 | 64.29 | 63.76 |
| 18/10/2021 | 63.22 | 64.29 | 63.76 |
| 19/10/2021 | 63.22 | 64.42 | 63.82 |
| 20/10/2021 | 63.2 | 64.36 | 63.78 |
| 21/10/2021 | 63.22 | 64.4 | 63.81 |
| 22/10/2021 | 63.21 | 64.42 | 63.82 |
| 25/10/2021 | 63.21 | 64.37 | 63.79 |
| 26/10/2021 | 63.22 | 64.37 | 63.8 |
| 27/10/2021 | 63.21 | 64.44 | 63.83 |
| 28/10/2021 | 63.2 | 64.43 | 63.82 |
| 29/10/2021 | 63.22 | 64.46 | 63.84 |
| 01/11/2021 | 63.2 | 64.42 | 63.81 |
| 02/11/2021 | 63.2 | 64.46 | 63.83 |
| 03/11/2021 | 63.3 | 64.33 | 63.82 |
| 04/11/2021 | 63.21 | 64.45 | 63.83 |
| 05/11/2021 | 63.24 | 64.34 | 63.79 |
| 08/11/2021 | 63.21 | 64.37 | 63.79 |
| 09/11/2021 | 63.21 | 64.46 | 63.84 |
| 11/11/2021 | 63.22 | 64.44 | 63.83 |
| 12/11/2021 | 63.21 | 64.35 | 63.78 |
| 15/11/2021 | 63.21 | 64.19 | 63.7 |
| 16/11/2021 | 63.25 | 64.42 | 63.84 |
| 17/11/2021 | 63.22 | 64.39 | 63.81 |
| 18/11/2021 | 63.2 | 64.4 | 63.8 |
| 19/11/2021 | 63.2 | 64.35 | 63.78 |
| 22/11/2021 | 63.25 | 64.36 | 63.81 |
| 23/11/2021 | 63.2 | 64.41 | 63.81 |
| 24/11/2021 | 63.21 | 64.4 | 63.81 |
| 25/11/2021 | 63.22 | 64.45 | 63.84 |
| 26/11/2021 | 63.2 | 64.39 | 63.8 |
| 29/11/2021 | 63.23 | 64.38 | 63.81 |
| 30/11/2021 | 63.12 | 64.45 | 63.79 |
| 01/12/2021 | 63.22 | 64.35 | 63.79 |
| 02/12/2021 | 63.2 | 64.43 | 63.82 |
| 03/12/2021 | 63.12 | 64.38 | 63.75 |
| 06/12/2021 | 63.2 | 64.35 | 63.78 |
| 07/12/2021 | 63.22 | 64.41 | 63.82 |
| 08/12/2021 | 63.2 | 64.44 | 63.82 |
| 09/12/2021 | 63.21 | 64.43 | 63.82 |
| 10/12/2021 | 63.23 | 64.42 | 63.83 |
| 13/12/2021 | 63.2 | 64.32 | 63.76 |
| 14/12/2021 | 63.21 | 64.43 | 63.82 |
| 15/12/2021 | 63.21 | 64.38 | 63.8 |
| 16/12/2021 | 63.2 | 64.38 | 63.79 |
| 17/12/2021 | 63.23 | 64.44 | 63.84 |
| 20/12/2021 | 63.22 | 64.35 | 63.79 |
| 21/12/2021 | 63.25 | 64.34 | 63.8 |
| 22/12/2021 | 63.23 | 64.4 | 63.82 |
| 23/12/2021 | 63.2 | 64.34 | 63.77 |
| 27/12/2021 | 63.2 | 64.28 | 63.74 |
| 28/12/2021 | 63.21 | 64.3 | 63.76 |
| 29/12/2021 | 63.2 | 64.35 | 63.78 |
| 30/12/2021 | 63.21 | 64.22 | 63.72 |
| 31/12/2021 | 63.2 | 64.37 | 63.79 |
| 03/01/2022 | 63.31 | 64.3 | 63.81 |
| 04/01/2022 | 63.2 | 64.39 | 63.8 |
| 05/01/2022 | 63.25 | 64.37 | 63.81 |
| 06/01/2022 | 63.22 | 64.31 | 63.77 |
| 07/01/2022 | 63.2 | 64.38 | 63.79 |
| 10/01/2022 | 63.2 | 63.73 | 63.47 |
| 11/01/2022 | 63.21 | 64.45 | 63.83 |
| 12/01/2022 | 63.2 | 64.45 | 63.83 |
| 13/01/2022 | 63.2 | 64.45 | 63.83 |
| 14/01/2022 | 63.21 | 64.44 | 63.83 |
| 17/01/2022 | 63.2 | 64.46 | 63.83 |
| 18/01/2022 | 63.22 | 64.38 | 63.8 |
| 19/01/2022 | 63.2 | 64.45 | 63.83 |
| 20/01/2022 | 63.2 | 64.45 | 63.83 |
| 21/01/2022 | 63.21 | 64.4 | 63.81 |
| 24/01/2022 | 63.2 | 64.43 | 63.82 |
| 25/01/2022 | 63.21 | 64.45 | 63.83 |
| 26/01/2022 | 63.2 | 64.39 | 63.8 |
| 27/01/2022 | 63.21 | 64.44 | 63.83 |
| 28/01/2022 | 63.2 | 64.42 | 63.81 |
| 31/01/2022 | 63.2 | 64.45 | 63.83 |
| 01/02/2022 | 63.2 | 64.43 | 63.82 |
| 02/02/2022 | 63.21 | 64.34 | 63.78 |
| 04/02/2022 | 63.22 | 64.46 | 63.84 |
| 07/02/2022 | 63.21 | 64.45 | 63.83 |
| 08/02/2022 | 63.25 | 64.45 | 63.85 |
| 09/02/2022 | 63.2 | 64.39 | 63.8 |
| 10/02/2022 | 63.2 | 64.45 | 63.83 |
| 11/02/2022 | 63.2 | 64.45 | 63.83 |
| 14/02/2022 | 63.24 | 64.41 | 63.83 |
| 15/02/2022 | 63.2 | 64.42 | 63.81 |
| 16/02/2022 | 63.2 | 64.41 | 63.81 |
| 17/02/2022 | 63.2 | 64.45 | 63.83 |
| 18/02/2022 | 63.2 | 64.46 | 63.83 |
| 21/02/2022 | 63.21 | 64.46 | 63.84 |
| 22/02/2022 | 63.21 | 64.44 | 63.83 |
| 23/02/2022 | 63.2 | 64.45 | 63.83 |
| 24/02/2022 | 63.2 | 64.41 | 63.81 |
| 25/02/2022 | 63.2 | 64.44 | 63.82 |
| 28/02/2022 | 63.21 | 64.44 | 63.83 |
| 01/03/2022 | 63.2 | 64.37 | 63.79 |
| 02/03/2022 | 63.2 | 64.41 | 63.81 |
| 03/03/2022 | 63.2 | 64.45 | 63.83 |
| 04/03/2022 | 63.21 | 64.45 | 63.83 |
| 07/03/2022 | 63.2 | 64.44 | 63.82 |
| 08/03/2022 | 63.2 | 64.45 | 63.83 |
| 09/03/2022 | 63.21 | 64.31 | 63.76 |
| 10/03/2022 | 63.2 | 64.43 | 63.82 |
| 11/03/2022 | 63.2 | 64.46 | 63.83 |
| 14/03/2022 | 63.2 | 64.45 | 63.83 |
| 15/03/2022 | 63.21 | 64.43 | 63.82 |
| 16/03/2022 | 63.2 | 64.44 | 63.82 |
| 17/03/2022 | 63.2 | 64.43 | 63.82 |
| 18/03/2022 | 63.2 | 64.47 | 63.84 |
| 21/03/2022 | 63.2 | 64.39 | 63.8 |
| 22/03/2022 | 63.21 | 64.38 | 63.8 |
| 23/03/2022 | 63.2 | 64.44 | 63.82 |
| 24/03/2022 | 63.21 | 64.46 | 63.84 |
| 25/03/2022 | 63.21 | 64.45 | 63.83 |
| 28/03/2022 | 63.21 | 64.25 | 63.73 |
| 29/03/2022 | 63.29 | 64.46 | 63.88 |
| 30/03/2022 | 63.21 | 64.42 | 63.82 |
| 31/03/2022 | 63.25 | 64.43 | 63.84 |
| 01/04/2022 | 63.2 | 64.46 | 63.83 |
| 04/04/2022 | 63.21 | 64.45 | 63.83 |
| 05/04/2022 | 63.23 | 64.45 | 63.84 |
| 06/04/2022 | 63.2 | 64.45 | 63.83 |
| 08/04/2022 | 63.21 | 64.44 | 63.83 |
| 11/04/2022 | 63.2 | 64.45 | 63.83 |
| 12/04/2022 | 63.2 | 64.34 | 63.77 |
| 13/04/2022 | 63.2 | 64.46 | 63.83 |
| 14/04/2022 | 63.2 | 64.46 | 63.83 |
| 18/04/2022 | 63.2 | 64.46 | 63.83 |
| 19/04/2022 | 63.2 | 64.45 | 63.83 |
| 20/04/2022 | 63.23 | 64.44 | 63.84 |
| 21/04/2022 | 63.23 | 64.46 | 63.85 |
| 22/04/2022 | 63.23 | 64.42 | 63.83 |
| 25/04/2020 | 63.2 | 64.42 | 63.81 |
| 26/04/2022 | 63.2 | 64.46 | 63.83 |
| 27/04/2022 | 63.2 | 64.43 | 63.82 |
| 28/04/2022 | 63.2 | 64.45 | 63.83 |
| 29/04/2022 | 63.21 | 64.44 | 63.83 |
| 03/05/2022 | 63.2 | 64.46 | 63.83 |
| 04/05/2022 | 63.24 | 64.44 | 63.84 |
| 05/05/2022 | 63.24 | 64.39 | 63.82 |
| 06/05/2022 | 63.2 | 64.44 | 63.82 |
| 09/05/2022 | 63.2 | 64.44 | 63.82 |
| 10/05/2022 | 63.21 | 64.45 | 63.83 |
| 11/05/2022 | 63.2 | 64.45 | 63.83 |
| 12/05/2022 | 63.2 | 64.37 | 63.79 |
| 13/05/2022 | 63.21 | 64.45 | 63.83 |
| 16/05/2022 | 63.23 | 64.46 | 63.85 |
| 17/05/2022 | 63.2 | 64.44 | 63.82 |
| 18/05/2022 | 63.2 | 64.46 | 63.83 |
| 19/05/2022 | 63.21 | 64.45 | 63.83 |
| 20/05/2022 | 63.23 | 64.45 | 63.84 |
| 23/05/2022 | 63.24 | 64.43 | 63.84 |
| 24/05/2022 | 63.21 | 64.45 | 63.83 |
| 25/05/2022 | 63.21 | 64.36 | 63.79 |
| 26/05/2022 | 63.3 | 64.43 | 63.87 |
| 27/05/2022 | 63.36 | 64.45 | 63.91 |
| 30/05/2022 | 63.21 | 64.39 | 63.8 |
| 31/05/2022 | 63.21 | 64.47 | 63.84 |
| 01/06/2022 | 63.22 | 64.47 | 63.85 |
| 02/06/2022 | 63.21 | 64.46 | 63.84 |
| 03/06/2022 | 63.23 | 64.46 | 63.85 |
| 06/06/2022 | 63.25 | 64.46 | 63.86 |
| 07/06/2022 | 63.22 | 64.45 | 63.84 |
| 08/06/2022 | 63.23 | 64.47 | 63.85 |
| 09/06/2022 | 63.23 | 64.43 | 63.83 |
| 10/06/2022 | 63.24 | 64.45 | 63.85 |
| 13/06/2022 | 63.22 | 64.46 | 63.84 |
| 14/06/2022 | 63.23 | 64.47 | 63.85 |
| 15/06/2022 | 63.22 | 64.48 | 63.85 |
| 16/06/2022 | 63.24 | 64.46 | 63.85 |
| 17/06/2022 | 63.22 | 64.45 | 63.84 |
| 20/06/2022 | 63.23 | 64.41 | 63.82 |
| 21/06/2022 | 63.24 | 64.48 | 63.86 |
| 22/06/2022 | 63.25 | 64.41 | 63.83 |
| 23/06/2022 | 63.25 | 64.47 | 63.86 |
| 24/06/2022 | 63.24 | 64.47 | 63.86 |
| 27/06/2022 | 63.25 | 64.49 | 63.87 |
| 28/06/2022 | 63.22 | 64.47 | 63.85 |
| 29/06/2022 | 63.24 | 64.48 | 63.86 |
| 30/06/2022 | 63.24 | 64.42 | 63.83 |
| 01/07/2022 | 63.23 | 64.47 | 63.85 |
| 04/07/2022 | 63.24 | 64.48 | 63.86 |
| 05/07/2022 | 63.25 | 64.48 | 63.87 |
| 06/07/2022 | 63.26 | 64.48 | 63.87 |
| 07/07/2022 | 63.29 | 64.48 | 63.89 |
| 08/07/2022 | 63.23 | 64.48 | 63.86 |
| 11/07/2022 | 63.27 | 64.49 | 63.88 |
| 12/07/2022 | 63.25 | 64.48 | 63.87 |
| 13/07/2022 | 63.24 | 64.48 | 63.86 |
| 14/07/2022 | 63.26 | 64.46 | 63.86 |
| 15/07/2022 | 63.27 | 64.5 | 63.89 |
| 18/07/2022 | 63.39 | 64.48 | 63.94 |
| 19/07/2022 | 63.33 | 64.49 | 63.91 |
| 20/07/2022 | 63.25 | 64.49 | 63.87 |
| 21/07/2022 | 63.36 | 64.47 | 63.92 |
| 22/07/2022 | 63.23 | 64.45 | 63.84 |
| 25/07/2022 | 63.28 | 64.47 | 63.88 |
| 26/07/2022 | 63.27 | 64.5 | 63.89 |
| 27/07/2022 | 63.25 | 64.48 | 63.87 |
| 28/07/2022 | 63.26 | 64.48 | 63.87 |
| 29/07/2022 | 63.25 | 64.47 | 63.86 |
| 01/08/2022 | 63.26 | 64.39 | 63.83 |
| 02/08/2022 | 63.24 | 64.5 | 63.87 |
| 03/08/2022 | 63.29 | 64.49 | 63.89 |
| 04/08/2022 | 63.26 | 64.48 | 63.87 |
| 05/08/2022 | 63.25 | 64.49 | 63.87 |
| 08/08/2022 | 63.31 | 64.49 | 63.9 |
| 09/08/2022 | 63.25 | 64.48 | 63.87 |
| 10/08/2022 | 63.27 | 64.49 | 63.88 |
| 11/08/2022 | 63.25 | 64.5 | 63.88 |
| 12/08/2022 | 63.25 | 64.5 | 63.88 |
| 15/08/2022 | 63.28 | 64.45 | 63.87 |
| 16/08/2022 | 63.25 | 64.5 | 63.88 |
| 17/08/2022 | 63.27 | 64.5 | 63.89 |
| 18/08/2022 | 63.26 | 64.38 | 63.82 |
| 19/08/2022 | 63.27 | 64.48 | 63.88 |
| 22/08/2022 | 63.35 | 64.49 | 63.92 |
| 23/08/2022 | 63.26 | 64.47 | 63.87 |
| 24/08/2022 | 63.27 | 64.48 | 63.88 |
| 25/08/2022 | 63.25 | 64.49 | 63.87 |
| 26/08/2022 | 63.26 | 64.37 | 63.82 |
| 29/08/2022 | 63.27 | 64.5 | 63.89 |
| 30/08/2022 | 63.26 | 64.5 | 63.88 |
| 31/08/2022 | 63.29 | 64.49 | 63.89 |
| 01/09/2022 | 63.35 | 64.48 | 63.92 |
| 02/09/2022 | 63.31 | 64.5 | 63.91 |
| 05/09/2022 | 63.27 | 64.49 | 63.88 |
| 06/09/2022 | 63.25 | 64.49 | 63.87 |
| 08/09/2022 | 63.28 | 64.49 | 63.89 |
| 09/09/2022 | 63.28 | 64.35 | 63.82 |
| 12/09/2022 | 63.28 | 64.5 | 63.89 |
| 13/09/2022 | 63.27 | 64.5 | 63.89 |
| 14/09/2022 | 63.25 | 64.5 | 63.88 |
| 15/09/2022 | 63.27 | 64.5 | 63.89 |
| 16/09/2022 | 63.33 | 64.49 | 63.91 |
| 19/09/2022 | 63.28 | 64.49 | 63.89 |
| 20/09/2022 | 63.28 | 64.5 | 63.89 |
| 21/09/2022 | 63.26 | 64.48 | 63.87 |
| 22/09/2022 | 63.32 | 64.49 | 63.91 |
| 23/09/2022 | 63.27 | 64.49 | 63.88 |
| 27/09/2022 | 63.25 | 64.49 | 63.87 |
| 28/09/2022 | 63.26 | 64.3 | 63.78 |
| 29/09/2022 | 63.25 | 64.49 | 63.87 |
| 30/09/2022 | 63.31 | 64.44 | 63.88 |
| 03/10/2022 | 63.27 | 64.49 | 63.88 |
| 05/10/2022 | 63.27 | 64.49 | 63.88 |
| 06/10/2022 | 63.26 | 64.49 | 63.88 |
| 07/10/2022 | 63.26 | 64.48 | 63.87 |
| 10/10/2022 | 63.28 | 64.44 | 63.86 |
| 11/10/2022 | 63.26 | 64.49 | 63.88 |
| 12/10/2022 | 63.26 | 64.47 | 63.87 |
| 13/10/2022 | 63.28 | 64.47 | 63.88 |
| 14/10/2022 | 63.29 | 64.5 | 63.9 |
| 17/10/2022 | 63.29 | 64.46 | 63.88 |
| 18/10/2022 | 63.26 | 64.49 | 63.88 |
| 19/10/2022 | 63.31 | 64.32 | 63.82 |
| 20/10/2022 | 63.26 | 64.48 | 63.87 |
| 21/10/2022 | 63.34 | 64.44 | 63.89 |
| 24/10/2022 | 63.26 | 64.49 | 63.88 |
| 25/10/2022 | 63.28 | 64.47 | 63.88 |
| 26/10/2022 | 63.28 | 64.47 | 63.88 |
| 27/10/2022 | 63.26 | 64.48 | 63.87 |
| 28/10/2022 | 63.28 | 64.38 | 63.83 |
| 31/10/2022 | 63.32 | 64.48 | 63.9 |
| 01/11/2022 | 63.31 | 64.48 | 63.9 |
| 02/11/2022 | 63.29 | 64.5 | 63.9 |
| 03/11/2022 | 63.27 | 64.5 | 63.89 |
| 04/11/2022 | 63.27 | 64.49 | 63.88 |
| 07/11/2022 | 63.25 | 64.49 | 63.87 |
| 08/11/2022 | 63.31 | 64.49 | 63.9 |
| 09/11/2022 | 63.27 | 64.46 | 63.87 |
| 11/11/2022 | 63.39 | 64.49 | 63.94 |
| 14/11/2022 | 63.26 | 64.5 | 63.88 |
| 15/11/2022 | 63.3 | 64.49 | 63.9 |
| 16/11/2022 | 63.31 | 64.46 | 63.89 |
| 17/11/2022 | 63.33 | 64.49 | 63.91 |
| 18/11/2022 | 63.25 | 64.48 | 63.87 |
| 21/11/2022 | 63.28 | 64.51 | 63.9 |
| 22/11/2022 | 63.31 | 64.48 | 63.9 |
| 23/11/2022 | 63.26 | 64.48 | 63.87 |
| 24/11/2022 | 63.35 | 64.46 | 63.91 |
| 25/11/2022 | 63.28 | 64.5 | 63.89 |
| 28/11/2022 | 63.26 | 64.5 | 63.88 |
| 29/11/2022 | 63.48 | 64.49 | 63.99 |
| 30/11/2022 | 63.27 | 64.46 | 63.87 |
| 01/12/2022 | 63.34 | 64.5 | 63.92 |
| 02/12/2022 | 63.39 | 64.49 | 63.94 |
| 05/12/2022 | 63.39 | 64.47 | 63.93 |
| 06/12/2022 | 63.39 | 64.47 | 63.93 |
| 07/12/2022 | 63.27 | 64.5 | 63.89 |
| 08/12/2022 | 63.3 | 64.48 | 63.89 |
| 09/12/2022 | 63.36 | 64.48 | 63.92 |
| 12/12/2022 | 63.31 | 64.5 | 63.91 |
| 13/12/2022 | 63.4 | 64.47 | 63.94 |
| 14/12/2022 | 63.25 | 64.49 | 63.87 |
| 15/12/2022 | 63.32 | 64.51 | 63.92 |
| 16/12/2022 | 63.29 | 64.48 | 63.89 |
| 19/12/2022 | 63.28 | 64.5 | 63.89 |
| 20/12/2022 | 63.27 | 64.46 | 63.87 |
| 21/12/2022 | 63.31 | 64.47 | 63.89 |
| 22/12/2022 | 63.25 | 64.48 | 63.87 |
| 23/12/2022 | 63.25 | 64.48 | 63.87 |
| 27/12/2022 | 63.28 | 64.42 | 63.85 |
| 28/12/2022 | 63.33 | 64.46 | 63.9 |
| 29/12/2022 | 63.27 | 64.48 | 63.88 |
| 30/12/2022 | 63.28 | 64.47 | 63.88 |
| 03/01/2023 | 63.3 | 64.5 | 63.9 |
| 04/01/2023 | 63.33 | 64.48 | 63.91 |
| 05/01/2023 | 63.3 | 64.5 | 63.9 |
| 06/01/2023 | 63.43 | 64.49 | 63.96 |
| 09/01/2023 | 63.26 | 64.5 | 63.88 |
| 10/01/2023 | 63.48 | 64.49 | 63.99 |
| 11/01/2023 | 63.37 | 64.51 | 63.94 |
| 12/01/2023 | 63.26 | 64.5 | 63.88 |
| 13/01/2023 | 63.28 | 64.5 | 63.89 |
| 16/01/2023 | 63.33 | 64.49 | 63.91 |
| 17/01/2023 | 63.32 | 64.46 | 63.89 |
| 18/01/2023 | 63.28 | 64.49 | 63.89 |
| 19/01/2023 | 63.29 | 64.5 | 63.9 |
| 20/01/2023 | 63.3 | 64.5 | 63.9 |
| 23/01/2023 | 63.26 | 64.5 | 63.88 |
| 24/01/2023 | 63.33 | 64.51 | 63.92 |
| 25/01/2023 | 63.29 | 64.5 | 63.9 |
| 26/01/2023 | 63.37 | 64.5 | 63.94 |
| 27/01/2023 | 63.25 | 64.5 | 63.88 |
| 30/01/2023 | 63.67 | 64.47 | 64.07 |
| 31/01/2023 | 63.29 | 64.5 | 63.9 |
| 01/02/2023 | 63.53 | 64.5 | 64.02 |
| 02/02/2023 | 63.38 | 64.5 | 63.94 |
| 06/02/2023 | 63.38 | 64.44 | 63.91 |
| 07/02/2023 | 63.32 | 64.5 | 63.91 |
| 08/02/2023 | 63.56 | 64.5 | 64.03 |
| 09/02/2023 | 63.37 | 64.51 | 63.94 |
| 10/02/2023 | 63.32 | 64.51 | 63.92 |
| 13/02/2023 | 63.31 | 64.51 | 63.91 |
| 14/02/2023 | 63.32 | 64.51 | 63.92 |
| 15/02/2023 | 63.38 | 64.51 | 63.95 |
| 16/02/2023 | 63.4 | 64.49 | 63.95 |
| 17/02/2023 | 63.28 | 64.51 | 63.9 |
| 20/02/2023 | 63.29 | 64.5 | 63.9 |
| 21/02/2023 | 63.3 | 64.45 | 63.88 |
| 22/02/2023 | 63.32 | 64.43 | 63.88 |
| 23/02/2023 | 63.28 | 64.45 | 63.87 |
| 24/02/2023 | 63.3 | 64.48 | 63.89 |
| 27/02/2023 | 63.36 | 64.5 | 63.93 |
| 28/02/2023 | 63.26 | 64.5 | 63.88 |
| 01/03/2023 | 63.48 | 64.51 | 64 |
| 02/03/2023 | 63.38 | 64.5 | 63.94 |
| 03/03/2023 | 63.38 | 64.52 | 63.95 |
| 06/03/2023 | 63.35 | 64.51 | 63.93 |
| 07/03/2023 | 63.39 | 64.51 | 63.95 |
| 08/03/2023 | 63.4 | 64.5 | 63.95 |
| 09/03/2023 | 63.34 | 64.5 | 63.92 |
| 10/03/2023 | 63.4 | 64.51 | 63.96 |
| 13/03/2023 | 63.28 | 64.51 | 63.9 |
| 14/03/2023 | 63.27 | 64.51 | 63.89 |
| 15/03/2023 | 63.26 | 64.5 | 63.88 |
| 16/03/2023 | 63.27 | 64.49 | 63.88 |
| 17/03/2023 | 63.27 | 64.5 | 63.89 |
| 20/03/2023 | 63.29 | 64.49 | 63.89 |
| 21/03/2023 | 63.36 | 64.51 | 63.94 |
| 22/03/2023 | 63.32 | 64.51 | 63.92 |
| 23/03/2023 | 63.27 | 64.51 | 63.89 |
| 24/03/2023 | 63.32 | 64.5 | 63.91 |
| 27/03/2023 | 63.3 | 64.51 | 63.91 |
| 28/03/2023 | 63.3 | 64.49 | 63.9 |
| 29/03/2023 | 63.3 | 64.51 | 63.91 |
| 30/03/2023 | 63.39 | 64.49 | 63.94 |
| 31/03/2023 | 63.46 | 64.51 | 63.99 |
| 03/04/2023 | 63.28 | 64.51 | 63.9 |
| 04/04/2023 | 63.44 | 64.5 | 63.97 |
| 05/04/2023 | 63.36 | 64.51 | 63.94 |
| 06/04/2023 | 63.28 | 64.5 | 63.89 |
| 10/04/2023 | 63.26 | 64.5 | 63.88 |
| 11/04/2023 | 63.28 | 64.51 | 63.9 |
| 12/04/2023 | 63.25 | 64.51 | 63.88 |
| 13/04/2023 | 63.25 | 64.5 | 63.88 |
| 14/04/2023 | 63.27 | 64.5 | 63.89 |
| 17/04/2023 | 63.25 | 64.5 | 63.88 |
| 18/04/2023 | 63.35 | 64.49 | 63.92 |
| 19/04/2023 | 63.28 | 64.51 | 63.9 |
| 20/04/2023 | 63.36 | 64.51 | 63.94 |
| 21/04/2023 | 63.28 | 64.51 | 63.9 |
| 24/04/2023 | 63.36 | 64.51 | 63.94 |
| 25/04/2023 | 63.27 | 64.47 | 63.87 |
| 26/04/2023 | 63.27 | 64.5 | 63.89 |
| 27/04/2023 | 63.3 | 64.51 | 63.91 |
| 28/04/2023 | 63.34 | 64.42 | 63.88 |
| 02/05/2023 | 63.43 | 64.5 | 63.97 |
| 03/05/2023 | 63.59 | 64.5 | 64.05 |
| 04/05/2023 | 63.28 | 64.49 | 63.89 |
| 05/05/2023 | 63.26 | 64.5 | 63.88 |
| 08/05/2023 | 63.39 | 64.5 | 63.95 |
| 09/05/2023 | 63.43 | 64.51 | 63.97 |
| 10/05/2023 | 63.29 | 64.48 | 63.89 |
| 11/05/2023 | 63.29 | 64.51 | 63.9 |
| 12/05/2023 | 63.33 | 64.47 | 63.9 |
| 15/05/2023 | 63.32 | 64.48 | 63.9 |
| 16/05/2023 | 63.49 | 64.51 | 64 |
| 17/05/2023 | 63.27 | 64.51 | 63.89 |
| 18/05/2023 | 63.28 | 64.5 | 63.89 |
| 19/05/2023 | 63.28 | 64.52 | 63.9 |
| 22/05/2023 | 63.29 | 64.51 | 63.9 |
| 23/05/2023 | 63.33 | 64.51 | 63.92 |
| 24/05/2023 | 63.33 | 64.51 | 63.92 |
| 25/05/2023 | 63.35 | 64.52 | 63.94 |
| 26/05/2023 | 63.36 | 64.51 | 63.94 |
| 29/05/2023 | 63.27 | 64.52 | 63.9 |
| 30/05/2023 | 63.34 | 64.52 | 63.93 |
| 31/05/2023 | 63.42 | 64.51 | 63.97 |
| 01/06/2023 | 63.26 | 64.5 | 63.88 |
| 02/06/2023 | 63.27 | 64.51 | 63.89 |
| 05/06/2023 | 63.37 | 64.52 | 63.94 |
| 06/06/2023 | 63.5 | 64.51 | 64.01 |
| 07/06/2023 | 63.28 | 64.51 | 63.9 |
| 08/06/2023 | 63.29 | 64.51 | 63.9 |
| 09/06/2023 | 63.28 | 64.38 | 63.83 |
| 12/06/2023 | 63.29 | 64.51 | 63.9 |
| 13/06/2023 | 63.33 | 64.52 | 63.93 |
| 14/06/2023 | 63.34 | 64.51 | 63.93 |
| 15/06/2023 | 63.36 | 64.46 | 63.925 |
| 16/06/2023 | 63.3 | 64.5 | 63.9 |
| 19/06/2023 | 63.28 | 64.49 | 63.89 |
| 20/06/2023 | 63.26 | 64.51 | 63.89 |
| 21/06/2023 | 63.29 | 64.52 | 63.91 |
| 22/06/2023 | 63.37 | 64.49 | 63.93 |
| 23/06/2023 | 63.33 | 64.52 | 63.93 |
| 27/06/2023 | 63.28 | 64.51 | 63.9 |
| 28/06/2023 | 63.27 | 64.51 | 63.89 |
| 29/06/2023 | 63.35 | 64.5 | 63.93 |
| 30/06/2023 | 63.49 | 64.46 | 63.98 |
| 03/07/2023 | 63.51 | 64.52 | 64.02 |
| 04/07/2023 | 63.37 | 64.5 | 63.94 |
| 05/07/2023 | 63.29 | 64.52 | 63.91 |
| 06/07/2023 | 63.33 | 64.5 | 63.92 |
| 07/07/2023 | 63.27 | 64.51 | 63.89 |
| 10/07/2023 | 63.34 | 64.51 | 63.93 |
| 11/07/2023 | 63.46 | 64.48 | 63.97 |
| 12/07/2023 | 63.3 | 64.51 | 63.91 |
| 13/07/2023 | 63.44 | 64.51 | 63.98 |
| 14/07/2023 | 63.29 | 64.48 | 63.89 |
| 17/07/2023 | 63.29 | 64.52 | 63.91 |
| 18/07/2023 | 63.37 | 64.52 | 63.95 |
| 19/07/2023 | 63.3 | 64.51 | 63.91 |
| 20/07/2023 | 63.3 | 64.5 | 63.9 |
| 21/07/2023 | 63.41 | 64.51 | 63.96 |
| 24/07/2023 | 63.32 | 64.48 | 63.9 |
| 25/07/2023 | 63.4 | 64.52 | 63.96 |
| 26/07/2023 | 63.27 | 64.51 | 63.89 |
| 27/07/2023 | 63.36 | 64.52 | 63.94 |
| 28/07/2023 | 63.29 | 64.51 | 63.9 |
| 31/07/2023 | 63.57 | 64.53 | 64.05 |
| 01/08/2023 | 63.33 | 64.52 | 63.93 |
| 02/08/2023 | 63.28 | 64.35 | 63.82 |
| 03/08/2023 | 63.29 | 64.51 | 63.9 |
| 04/08/2023 | 63.26 | 64.49 | 63.88 |
| 07/08/2023 | 63.31 | 64.5 | 63.91 |
| 08/08/2023 | 63.31 | 64.52 | 63.92 |
| 09/08/2023 | 63.69 | 64.48 | 64.09 |
| 10/08/2023 | 63.29 | 64.5 | 63.9 |
| 11/08/2023 | 63.42 | 64.53 | 63.98 |
| 14/08/2023 | 63.27 | 64.52 | 63.9 |
| 15/08/2023 | 63.33 | 64.52 | 63.93 |
| 16/08/2023 | 63.33 | 64.52 | 63.93 |
| 17/08/2023 | 63.43 | 64.51 | 63.97 |
| 18/08/2023 | 63.34 | 64.52 | 63.93 |
| 21/08/2023 | 63.42 | 64.52 | 63.97 |
| 22/08/2023 | 63.34 | 64.52 | 63.93 |
| 23/08/2023 | 63.29 | 64.52 | 63.91 |
| 24/08/2023 | 63.37 | 64.52 | 63.95 |
| 25/08/2023 | 63.32 | 64.52 | 63.92 |
| 28/08/2023 | 63.39 | 64.52 | 63.96 |
| 29/08/2023 | 63.3 | 64.51 | 63.91 |
| 30/08/2023 | 63.42 | 64.45 | 63.94 |
| 31/08/2023 | 63.34 | 64.5 | 63.92 |
| 01/09/2023 | 63.62 | 64.53 | 64.08 |
| 04/09/2023 | 63.46 | 64.52 | 63.99 |
| 05/09/2023 | 63.68 | 64.51 | 64.1 |
| 06/09/2023 | 63.29 | 64.51 | 63.9 |
| 08/09/2023 | 63.36 | 64.48 | 63.92 |
| 11/09/2023 | 63.26 | 64.47 | 63.87 |
| 12/09/2023 | 63.3 | 64.51 | 63.91 |
| 13/09/2023 | 63.26 | 64.5 | 63.88 |
| 14/09/2023 | 63.29 | 64.52 | 63.91 |
| 15/09/2023 | 63.29 | 64.53 | 63.91 |
| 18/09/2023 | 63.35 | 64.52 | 63.94 |
| 19/09/2023 | 63.27 | 64.51 | 63.89 |
| 20/09/2023 | 63.37 | 64.51 | 63.94 |
| 21/09/2023 | 63.34 | 64.51 | 63.93 |
| 22/09/2023 | 63.33 | 64.52 | 63.93 |
| 26/09/2023 | 63.27 | 64.49 | 63.88 |
| 27/09/2023 | 63.32 | 64.47 | 63.9 |
| 28/09/2023 | 63.37 | 64.5 | 63.94 |
| 29/09/2023 | 63.36 | 64.52 | 63.94 |
| 02/10/2023 | 63.34 | 64.52 | 63.93 |
| 03/10/2023 | 63.46 | 64.51 | 63.99 |
| 05/10/2023 | 63.33 | 64.51 | 63.92 |
| 06/10/2023 | 63.3 | 64.52 | 63.91 |
| 09/10/2023 | 63.29 | 64.51 | 63.9 |
| 10/10/2023 | 63.48 | 64.52 | 64 |
| 12/10/2023 | 63.32 | 64.51 | 63.92 |
| 13/10/2023 | 63.28 | 64.51 | 63.9 |
| 16/10/2023 | 63.49 | 64.49 | 63.99 |
| 17/10/2023 | 63.32 | 64.51 | 63.92 |
| 18/10/2023 | 63.31 | 64.52 | 63.92 |
| 19/10/2023 | 63.26 | 64.51 | 63.89 |
| 20/10/2023 | 63.39 | 64.52 | 63.96 |
| 23/10/2023 | 63.29 | 64.5 | 63.9 |
| 24/10/2023 | 63.39 | 64.52 | 63.96 |
| 25/10/2023 | 63.46 | 64.52 | 63.99 |
| 26/10/2023 | 63.42 | 64.45 | 63.94 |
| 27/10/2023 | 63.35 | 64.5 | 63.93 |
| 30/10/2023 | 63.36 | 64.51 | 63.94 |
| 31/10/2023 | 63.56 | 64.52 | 64.04 |
| 01/11/2023 | 63.38 | 64.51 | 63.95 |
| 02/11/2023 | 63.43 | 64.52 | 63.98 |
| 03/11/2023 | 63.32 | 64.5 | 63.91 |
| 06/11/2023 | 63.47 | 64.54 | 64.01 |
| 07/11/2023 | 63.44 | 64.53 | 63.99 |
| 08/11/2023 | 63.27 | 64.48 | 63.88 |
| 09/11/2023 | 63.45 | 64.51 | 63.98 |
| 13/11/2023 | 63.44 | 64.52 | 63.98 |
| 14/11/2023 | 63.29 | 64.53 | 63.91 |
| 15/11/2023 | 63.34 | 64.52 | 63.93 |
| 16/11/2023 | 63.33 | 64.52 | 63.93 |
| 17/11/2023 | 63.43 | 64.53 | 63.98 |
| 20/11/2023 | 63.34 | 64.46 | 63.9 |
| 21/11/2023 | 63.36 | 64.52 | 63.94 |
| 22/11/2023 | 63.34 | 64.54 | 63.94 |
| 23/11/2023 | 63.28 | 64.51 | 63.9 |
| 24/11/2023 | 63.34 | 64.54 | 63.94 |
| 27/11/2023 | 63.41 | 64.56 | 63.99 |
| 28/11/2023 | 63.44 | 64.52 | 63.98 |
| 29/11/2023 | 63.43 | 64.54 | 63.99 |
| 30/11/2023 | 63.47 | 64.54 | 64 |
| 01/12/2023 | 63.43 | 64.53 | 63.98 |
| 04/12/2023 | 63.35 | 64.52 | 63.94 |
| 05/12/2023 | 63.53 | 64.54 | 64.04 |
| 06/12/2023 | 63.42 | 64.54 | 63.98 |
| 07/12/2023 | 63.58 | 64.55 | 64.07 |
| 08/12/2023 | 63.35 | 64.53 | 63.94 |
| 11/12/2023 | 63.35 | 64.54 | 63.945 |
| 12/12/2023 | 63.36 | 64.54 | 63.945 |
| 13/12/2023 | 63.32 | 64.52 | 63.92 |
| 14/12/2023 | 63.49 | 64.52 | 64.01 |
| 15/12/2023 | 63.4 | 64.51 | 63.96 |
| 18/12/2023 | 63.32 | 64.51 | 63.92 |
| 19/12/2023 | 63.28 | 64.53 | 63.91 |
| 20/12/2023 | 63.38 | 64.53 | 63.96 |
| 21/12/2023 | 63.25 | 64.41 | 63.83 |
| 22/12/2023 | 63.4 | 64.53 | 63.97 |
| 26/12/2023 | 63.37 | 64.52 | 63.95 |
| 27/12/2023 | 63.28 | 64.49 | 63.89 |
| 28/12/2023 | 63.32 | 64.53 | 63.93 |
| 29/12/2023 | 63.34 | 64.54 | 63.94 |
| 02/01/2024 | 63.92 | 64.55 | 64.24 |
| 03/01/2024 | 63.81 | 64.54 | 64.18 |
| 04/01/2024 | 63.41 | 64.53 | 63.97 |
| 05/01/2024 | 63.41 | 64.5 | 63.96 |
| 08/01/2024 | 63.35 | 64.54 | 63.95 |
| 09/01/2024 | 63.4 | 64.53 | 63.97 |
| 10/01/2024 | 63.45 | 64.53 | 63.99 |
| 11/01/2024 | 63.42 | 64.55 | 63.99 |
| 12/01/2024 | 63.31 | 64.54 | 63.93 |
| 15/01/2024 | 63.44 | 64.53 | 63.99 |
| 16/01/2024 | 63.36 | 64.53 | 63.95 |
| 17/01/2024 | 63.39 | 64.54 | 63.97 |
| 18/01/2024 | 63.29 | 64.53 | 63.91 |
| 19/01/2024 | 63.37 | 64.53 | 63.95 |
| 22/01/2024 | 63.27 | 64.53 | 63.9 |
| 23/01/2024 | 63.29 | 64.52 | 63.91 |
| 24/01/2024 | 63.45 | 64.54 | 64 |
| 25/01/2024 | 63.36 | 64.53 | 63.95 |
| 26/01/2024 | 63.51 | 64.52 | 64.02 |
| 29/01/2024 | 63.39 | 64.52 | 63.96 |
| 30/01/2024 | 63.54 | 64.54 | 64.04 |
| 31/01/2024 | 63.52 | 64.54 | 64.03 |
| 01/02/2024 | 63.41 | 64.53 | 63.97 |
| 02/02/2024 | 63.5 | 64.52 | 64.01 |
| 05/02/2024 | 63.35 | 64.54 | 63.95 |
| 06/02/2024 | 63.43 | 64.53 | 63.98 |
| 07/02/2024 | 63.37 | 64.54 | 63.96 |
| 08/02/2024 | 63.36 | 64.52 | 63.94 |
| 09/02/2024 | 63.34 | 64.53 | 63.94 |
| 12/02/2024 | 63.32 | 64.55 | 63.94 |
| 13/02/2024 | 63.38 | 64.52 | 63.95 |
| 14/02/2024 | 63.3 | 64.52 | 63.91 |
| 15/02/2024 | 63.39 | 64.53 | 63.96 |
| 16/02/2024 | 63.31 | 64.53 | 63.92 |
| 19/02/2024 | 63.31 | 64.52 | 63.92 |
| 20/02/2024 | 63.37 | 64.47 | 63.92 |
| 21/02/2024 | 63.29 | 64.52 | 63.91 |
| 22/02/2024 | 63.32 | 64.52 | 63.92 |
| 23/02/2024 | 63.34 | 64.53 | 63.94 |
| 26/02/2024 | 63.42 | 64.54 | 63.98 |
| 27/02/2024 | 63.33 | 64.52 | 63.93 |
| 28/02/2024 | 63.49 | 64.52 | 64.01 |
| 29/02/2024 | 63.58 | 64.55 | 64.07 |
| 01/03/2024 | 63.45 | 64.55 | 64 |
| 04/03/2024 | 63.33 | 64.52 | 63.93 |
| 05/03/2024 | 63.38 | 64.54 | 63.96 |
| 06/03/2024 | 63.45 | 64.53 | 63.99 |
| 07/03/2024 | 63.35 | 64.52 | 63.94 |
| 08/03/2024 | 63.3 | 64.53 | 63.92 |
| 11/03/2024 | 63.39 | 64.54 | 63.97 |
| 12/03/2024 | 63.33 | 64.54 | 63.94 |
| 13/03/2024 | 63.44 | 64.55 | 64 |
| 14/03/2024 | 63.39 | 64.52 | 63.96 |
| 15/03/2024 | 63.41 | 64.53 | 63.97 |
| 18/03/2024 | 63.39 | 64.53 | 63.96 |
| 19/03/2024 | 63.35 | 64.53 | 63.94 |
| 20/03/2024 | 63.32 | 64.53 | 63.93 |
| 21/03/2024 | 63.4 | 64.5 | 63.95 |
| 22/03/2024 | 63.37 | 64.53 | 63.95 |
| 25/03/2024 | 63.38 | 64.53 | 63.96 |
| 26/03/2024 | 63.32 | 64.53 | 63.93 |
| 27/03/2024 | 63.38 | 64.54 | 63.96 |
| 28/03/2024 | 63.41 | 64.53 | 63.97 |
| 01/04/2024 | 63.5 | 64.53 | 64.02 |
| 02/04/2024 | 63.8 | 64.55 | 64.18 |
| 03/04/2024 | 63.39 | 64.55 | 63.97 |
| 04/04/2024 | 63.67 | 64.55 | 64.11 |
| 05/04/2024 | 63.35 | 64.55 | 63.95 |
| 09/04/2024 | 63.63 | 64.56 | 64.1 |
| 10/04/2024 | 63.43 | 64.54 | 63.99 |
| 11/04/2024 | 63.26 | 64.52 | 63.89 |
| 12/04/2024 | 63.29 | 64.52 | 63.91 |
| 15/04/2024 | 63.73 | 64.55 | 64.14 |
| 16/04/2024 | 63.51 | 64.55 | 64.03 |
| 17/04/2024 | 63.42 | 64.53 | 63.98 |
| 18/04/2024 | 63.39 | 64.53 | 63.96 |
| 19/04/2024 | 63.4 | 64.55 | 63.98 |
| 22/04/2024 | 63.36 | 64.54 | 63.95 |
| 23/04/2024 | 63.53 | 64.54 | 64.04 |
| 24/04/2024 | 63.52 | 64.54 | 64.03 |
| 25/04/2024 | 63.38 | 64.55 | 63.97 |
| 26/04/2024 | 63.33 | 64.53 | 63.93 |
| 29/04/2024 | 63.33 | 64.5 | 63.92 |
| 30/04/2024 | 63.58 | 64.54 | 64.06 |